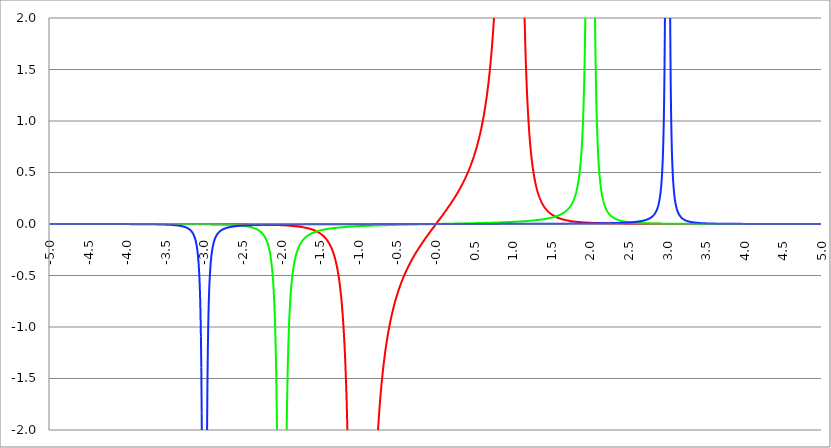
| Category | Series 1 | Series 0 | Series 2 |
|---|---|---|---|
| -5.0 | 0 | 0 | 0 |
| -4.995 | 0 | 0 | 0 |
| -4.99 | 0 | 0 | 0 |
| -4.985 | 0 | 0 | 0 |
| -4.98 | 0 | 0 | 0 |
| -4.975 | 0 | 0 | 0 |
| -4.97 | 0 | 0 | 0 |
| -4.965000000000001 | 0 | 0 | 0 |
| -4.960000000000001 | 0 | 0 | 0 |
| -4.955000000000001 | 0 | 0 | 0 |
| -4.950000000000001 | 0 | 0 | 0 |
| -4.945000000000001 | 0 | 0 | 0 |
| -4.940000000000001 | 0 | 0 | 0 |
| -4.935000000000001 | 0 | 0 | 0 |
| -4.930000000000001 | 0 | 0 | 0 |
| -4.925000000000002 | 0 | 0 | 0 |
| -4.920000000000002 | 0 | 0 | 0 |
| -4.915000000000002 | 0 | 0 | 0 |
| -4.910000000000002 | 0 | 0 | 0 |
| -4.905000000000002 | 0 | 0 | 0 |
| -4.900000000000002 | 0 | 0 | 0 |
| -4.895000000000002 | 0 | 0 | 0 |
| -4.890000000000002 | 0 | 0 | 0 |
| -4.885000000000002 | 0 | 0 | 0 |
| -4.880000000000002 | 0 | 0 | 0 |
| -4.875000000000003 | 0 | 0 | 0 |
| -4.870000000000003 | 0 | 0 | 0 |
| -4.865000000000003 | 0 | 0 | 0 |
| -4.860000000000003 | 0 | 0 | 0 |
| -4.855000000000003 | 0 | 0 | 0 |
| -4.850000000000003 | 0 | 0 | 0 |
| -4.845000000000003 | 0 | 0 | 0 |
| -4.840000000000003 | 0 | 0 | 0 |
| -4.835000000000003 | 0 | 0 | 0 |
| -4.830000000000004 | 0 | 0 | 0 |
| -4.825000000000004 | 0 | 0 | 0 |
| -4.820000000000004 | 0 | 0 | 0 |
| -4.815000000000004 | 0 | 0 | 0 |
| -4.810000000000004 | 0 | 0 | 0 |
| -4.805000000000004 | 0 | 0 | 0 |
| -4.800000000000004 | 0 | 0 | 0 |
| -4.795000000000004 | 0 | 0 | 0 |
| -4.790000000000004 | 0 | 0 | 0 |
| -4.785000000000004 | 0 | 0 | 0 |
| -4.780000000000004 | 0 | 0 | 0 |
| -4.775000000000004 | 0 | 0 | 0 |
| -4.770000000000004 | 0 | 0 | 0 |
| -4.765000000000005 | 0 | 0 | 0 |
| -4.760000000000005 | 0 | 0 | 0 |
| -4.755000000000005 | 0 | 0 | 0 |
| -4.750000000000005 | 0 | 0 | 0 |
| -4.745000000000005 | 0 | 0 | 0 |
| -4.740000000000005 | 0 | 0 | 0 |
| -4.735000000000005 | 0 | 0 | 0 |
| -4.730000000000005 | 0 | 0 | 0 |
| -4.725000000000006 | 0 | 0 | 0 |
| -4.720000000000006 | 0 | 0 | 0 |
| -4.715000000000006 | 0 | 0 | 0 |
| -4.710000000000006 | 0 | 0 | 0 |
| -4.705000000000006 | 0 | 0 | 0 |
| -4.700000000000006 | 0 | 0 | 0 |
| -4.695000000000006 | 0 | 0 | 0 |
| -4.690000000000006 | 0 | 0 | 0 |
| -4.685000000000007 | 0 | 0 | 0 |
| -4.680000000000007 | 0 | 0 | 0 |
| -4.675000000000007 | 0 | 0 | 0 |
| -4.670000000000007 | 0 | 0 | 0 |
| -4.665000000000007 | 0 | 0 | 0 |
| -4.660000000000007 | 0 | 0 | 0 |
| -4.655000000000007 | 0 | 0 | 0 |
| -4.650000000000007 | 0 | 0 | 0 |
| -4.645000000000007 | 0 | 0 | 0 |
| -4.640000000000008 | 0 | 0 | 0 |
| -4.635000000000008 | 0 | 0 | 0 |
| -4.630000000000008 | 0 | 0 | 0 |
| -4.625000000000008 | 0 | 0 | 0 |
| -4.620000000000008 | 0 | 0 | 0 |
| -4.615000000000008 | 0 | 0 | 0 |
| -4.610000000000008 | 0 | 0 | 0 |
| -4.605000000000008 | 0 | 0 | 0 |
| -4.600000000000008 | 0 | 0 | 0 |
| -4.595000000000009 | 0 | 0 | 0 |
| -4.590000000000009 | 0 | 0 | 0 |
| -4.585000000000009 | 0 | 0 | 0 |
| -4.580000000000009 | 0 | 0 | 0 |
| -4.57500000000001 | 0 | 0 | 0 |
| -4.57000000000001 | 0 | 0 | 0 |
| -4.565000000000009 | 0 | 0 | 0 |
| -4.560000000000009 | 0 | 0 | 0 |
| -4.555000000000009 | 0 | 0 | 0 |
| -4.55000000000001 | 0 | 0 | 0 |
| -4.54500000000001 | 0 | 0 | 0 |
| -4.54000000000001 | 0 | 0 | 0 |
| -4.53500000000001 | 0 | 0 | 0 |
| -4.53000000000001 | 0 | 0 | 0 |
| -4.52500000000001 | 0 | 0 | 0 |
| -4.52000000000001 | 0 | 0 | 0 |
| -4.51500000000001 | 0 | 0 | 0 |
| -4.51000000000001 | 0 | 0 | 0 |
| -4.505000000000011 | 0 | 0 | 0 |
| -4.500000000000011 | 0 | 0 | 0 |
| -4.495000000000011 | 0 | 0 | 0 |
| -4.490000000000011 | 0 | 0 | 0 |
| -4.485000000000011 | 0 | 0 | 0 |
| -4.480000000000011 | 0 | 0 | 0 |
| -4.475000000000011 | 0 | 0 | 0 |
| -4.470000000000011 | 0 | 0 | 0 |
| -4.465000000000011 | 0 | 0 | 0 |
| -4.460000000000011 | 0 | 0 | 0 |
| -4.455000000000012 | 0 | 0 | 0 |
| -4.450000000000012 | 0 | 0 | 0 |
| -4.445000000000012 | 0 | 0 | 0 |
| -4.440000000000012 | 0 | 0 | 0 |
| -4.435000000000012 | 0 | 0 | 0 |
| -4.430000000000012 | 0 | 0 | 0 |
| -4.425000000000012 | 0 | 0 | 0 |
| -4.420000000000012 | 0 | 0 | 0 |
| -4.415000000000012 | 0 | 0 | 0 |
| -4.410000000000013 | 0 | 0 | 0 |
| -4.405000000000013 | 0 | 0 | 0 |
| -4.400000000000013 | 0 | 0 | 0 |
| -4.395000000000013 | 0 | 0 | 0 |
| -4.390000000000013 | 0 | 0 | 0 |
| -4.385000000000013 | 0 | 0 | 0 |
| -4.380000000000013 | 0 | 0 | 0 |
| -4.375000000000013 | 0 | 0 | 0 |
| -4.370000000000013 | 0 | 0 | 0 |
| -4.365000000000013 | 0 | 0 | 0 |
| -4.360000000000014 | 0 | 0 | 0 |
| -4.355000000000014 | 0 | 0 | -0.001 |
| -4.350000000000014 | 0 | 0 | -0.001 |
| -4.345000000000014 | 0 | 0 | -0.001 |
| -4.340000000000014 | 0 | 0 | -0.001 |
| -4.335000000000014 | 0 | 0 | -0.001 |
| -4.330000000000014 | 0 | 0 | -0.001 |
| -4.325000000000014 | 0 | 0 | -0.001 |
| -4.320000000000014 | 0 | 0 | -0.001 |
| -4.315000000000015 | 0 | 0 | -0.001 |
| -4.310000000000015 | 0 | 0 | -0.001 |
| -4.305000000000015 | 0 | 0 | -0.001 |
| -4.300000000000015 | 0 | 0 | -0.001 |
| -4.295000000000015 | 0 | 0 | -0.001 |
| -4.290000000000015 | 0 | 0 | -0.001 |
| -4.285000000000015 | 0 | 0 | -0.001 |
| -4.280000000000015 | 0 | 0 | -0.001 |
| -4.275000000000015 | 0 | 0 | -0.001 |
| -4.270000000000015 | 0 | 0 | -0.001 |
| -4.265000000000016 | 0 | 0 | -0.001 |
| -4.260000000000016 | 0 | 0 | -0.001 |
| -4.255000000000016 | 0 | 0 | -0.001 |
| -4.250000000000016 | 0 | 0 | -0.001 |
| -4.245000000000016 | 0 | 0 | -0.001 |
| -4.240000000000016 | 0 | 0 | -0.001 |
| -4.235000000000016 | 0 | 0 | -0.001 |
| -4.230000000000016 | 0 | 0 | -0.001 |
| -4.225000000000017 | 0 | 0 | -0.001 |
| -4.220000000000017 | 0 | 0 | -0.001 |
| -4.215000000000017 | 0 | 0 | -0.001 |
| -4.210000000000017 | 0 | 0 | -0.001 |
| -4.205000000000017 | 0 | 0 | -0.001 |
| -4.200000000000017 | 0 | 0 | -0.001 |
| -4.195000000000017 | 0 | 0 | -0.001 |
| -4.190000000000017 | 0 | 0 | -0.001 |
| -4.185000000000017 | 0 | 0 | -0.001 |
| -4.180000000000017 | 0 | 0 | -0.001 |
| -4.175000000000018 | 0 | 0 | -0.001 |
| -4.170000000000018 | 0 | 0 | -0.001 |
| -4.165000000000018 | 0 | 0 | -0.001 |
| -4.160000000000018 | 0 | 0 | -0.001 |
| -4.155000000000018 | 0 | 0 | -0.001 |
| -4.150000000000018 | 0 | 0 | -0.001 |
| -4.145000000000018 | 0 | 0 | -0.001 |
| -4.140000000000018 | 0 | 0 | -0.001 |
| -4.135000000000018 | 0 | 0 | -0.001 |
| -4.130000000000019 | 0 | 0 | -0.001 |
| -4.125000000000019 | 0 | 0 | -0.001 |
| -4.120000000000019 | 0 | 0 | -0.001 |
| -4.115000000000019 | 0 | 0 | -0.001 |
| -4.110000000000019 | 0 | 0 | -0.001 |
| -4.105000000000019 | 0 | 0 | -0.001 |
| -4.100000000000019 | 0 | 0 | -0.001 |
| -4.095000000000019 | 0 | 0 | -0.001 |
| -4.090000000000019 | 0 | 0 | -0.001 |
| -4.085000000000019 | 0 | 0 | -0.001 |
| -4.08000000000002 | 0 | 0 | -0.001 |
| -4.07500000000002 | 0 | 0 | -0.001 |
| -4.07000000000002 | 0 | 0 | -0.001 |
| -4.06500000000002 | 0 | 0 | -0.001 |
| -4.06000000000002 | 0 | 0 | -0.001 |
| -4.05500000000002 | 0 | 0 | -0.001 |
| -4.05000000000002 | 0 | 0 | -0.001 |
| -4.04500000000002 | 0 | 0 | -0.001 |
| -4.04000000000002 | 0 | 0 | -0.001 |
| -4.03500000000002 | 0 | 0 | -0.001 |
| -4.03000000000002 | 0 | 0 | -0.001 |
| -4.025000000000021 | 0 | 0 | -0.001 |
| -4.020000000000021 | 0 | 0 | -0.001 |
| -4.015000000000021 | 0 | 0 | -0.001 |
| -4.010000000000021 | 0 | 0 | -0.001 |
| -4.005000000000021 | 0 | 0 | -0.001 |
| -4.000000000000021 | 0 | 0 | -0.001 |
| -3.995000000000021 | 0 | 0 | -0.001 |
| -3.990000000000021 | 0 | 0 | -0.001 |
| -3.985000000000022 | 0 | 0 | -0.001 |
| -3.980000000000022 | 0 | 0 | -0.001 |
| -3.975000000000022 | 0 | 0 | -0.001 |
| -3.970000000000022 | 0 | 0 | -0.001 |
| -3.965000000000022 | 0 | 0 | -0.001 |
| -3.960000000000022 | 0 | 0 | -0.001 |
| -3.955000000000022 | 0 | 0 | -0.001 |
| -3.950000000000022 | 0 | 0 | -0.001 |
| -3.945000000000022 | 0 | 0 | -0.001 |
| -3.940000000000023 | 0 | 0 | -0.001 |
| -3.935000000000023 | 0 | 0 | -0.001 |
| -3.930000000000023 | 0 | 0 | -0.001 |
| -3.925000000000023 | 0 | 0 | -0.001 |
| -3.920000000000023 | 0 | 0 | -0.001 |
| -3.915000000000023 | 0 | 0 | -0.001 |
| -3.910000000000023 | 0 | 0 | -0.001 |
| -3.905000000000023 | 0 | 0 | -0.001 |
| -3.900000000000023 | 0 | 0 | -0.001 |
| -3.895000000000023 | 0 | 0 | -0.001 |
| -3.890000000000024 | 0 | 0 | -0.002 |
| -3.885000000000024 | 0 | 0 | -0.002 |
| -3.880000000000024 | 0 | 0 | -0.002 |
| -3.875000000000024 | 0 | 0 | -0.002 |
| -3.870000000000024 | 0 | 0 | -0.002 |
| -3.865000000000024 | 0 | 0 | -0.002 |
| -3.860000000000024 | 0 | 0 | -0.002 |
| -3.855000000000024 | 0 | 0 | -0.002 |
| -3.850000000000024 | 0 | 0 | -0.002 |
| -3.845000000000025 | 0 | 0 | -0.002 |
| -3.840000000000025 | 0 | 0 | -0.002 |
| -3.835000000000025 | 0 | 0 | -0.002 |
| -3.830000000000025 | 0 | 0 | -0.002 |
| -3.825000000000025 | 0 | 0 | -0.002 |
| -3.820000000000025 | 0 | 0 | -0.002 |
| -3.815000000000025 | 0 | 0 | -0.002 |
| -3.810000000000025 | 0 | 0 | -0.002 |
| -3.805000000000025 | 0 | 0 | -0.002 |
| -3.800000000000026 | 0 | -0.001 | -0.002 |
| -3.795000000000026 | 0 | -0.001 | -0.002 |
| -3.790000000000026 | 0 | -0.001 | -0.002 |
| -3.785000000000026 | 0 | -0.001 | -0.002 |
| -3.780000000000026 | 0 | -0.001 | -0.002 |
| -3.775000000000026 | 0 | -0.001 | -0.002 |
| -3.770000000000026 | 0 | -0.001 | -0.002 |
| -3.765000000000026 | 0 | -0.001 | -0.002 |
| -3.760000000000026 | 0 | -0.001 | -0.002 |
| -3.755000000000026 | 0 | -0.001 | -0.002 |
| -3.750000000000027 | 0 | -0.001 | -0.002 |
| -3.745000000000027 | 0 | -0.001 | -0.002 |
| -3.740000000000027 | 0 | -0.001 | -0.002 |
| -3.735000000000027 | 0 | -0.001 | -0.002 |
| -3.730000000000027 | 0 | -0.001 | -0.002 |
| -3.725000000000027 | 0 | -0.001 | -0.003 |
| -3.720000000000027 | 0 | -0.001 | -0.003 |
| -3.715000000000027 | 0 | -0.001 | -0.003 |
| -3.710000000000027 | 0 | -0.001 | -0.003 |
| -3.705000000000028 | 0 | -0.001 | -0.003 |
| -3.700000000000028 | 0 | -0.001 | -0.003 |
| -3.695000000000028 | 0 | -0.001 | -0.003 |
| -3.690000000000028 | 0 | -0.001 | -0.003 |
| -3.685000000000028 | 0 | -0.001 | -0.003 |
| -3.680000000000028 | 0 | -0.001 | -0.003 |
| -3.675000000000028 | 0 | -0.001 | -0.003 |
| -3.670000000000028 | 0 | -0.001 | -0.003 |
| -3.665000000000028 | 0 | -0.001 | -0.003 |
| -3.660000000000028 | 0 | -0.001 | -0.003 |
| -3.655000000000029 | 0 | -0.001 | -0.003 |
| -3.650000000000029 | 0 | -0.001 | -0.003 |
| -3.645000000000029 | 0 | -0.001 | -0.003 |
| -3.640000000000029 | 0 | -0.001 | -0.003 |
| -3.635000000000029 | 0 | -0.001 | -0.004 |
| -3.630000000000029 | 0 | -0.001 | -0.004 |
| -3.625000000000029 | 0 | -0.001 | -0.004 |
| -3.620000000000029 | 0 | -0.001 | -0.004 |
| -3.615000000000029 | 0 | -0.001 | -0.004 |
| -3.61000000000003 | 0 | -0.001 | -0.004 |
| -3.60500000000003 | 0 | -0.001 | -0.004 |
| -3.60000000000003 | 0 | -0.001 | -0.004 |
| -3.59500000000003 | 0 | -0.001 | -0.004 |
| -3.59000000000003 | 0 | -0.001 | -0.004 |
| -3.58500000000003 | 0 | -0.001 | -0.004 |
| -3.58000000000003 | 0 | -0.001 | -0.004 |
| -3.57500000000003 | 0 | -0.001 | -0.004 |
| -3.57000000000003 | 0 | -0.001 | -0.005 |
| -3.565000000000031 | 0 | -0.001 | -0.005 |
| -3.560000000000031 | 0 | -0.001 | -0.005 |
| -3.555000000000031 | 0 | -0.001 | -0.005 |
| -3.550000000000031 | 0 | -0.001 | -0.005 |
| -3.545000000000031 | 0 | -0.001 | -0.005 |
| -3.540000000000031 | 0 | -0.001 | -0.005 |
| -3.535000000000031 | 0 | -0.001 | -0.005 |
| -3.530000000000031 | 0 | -0.001 | -0.005 |
| -3.525000000000031 | 0 | -0.001 | -0.006 |
| -3.520000000000032 | 0 | -0.001 | -0.006 |
| -3.515000000000032 | 0 | -0.001 | -0.006 |
| -3.510000000000032 | 0 | -0.001 | -0.006 |
| -3.505000000000032 | 0 | -0.001 | -0.006 |
| -3.500000000000032 | 0 | -0.001 | -0.006 |
| -3.495000000000032 | 0 | -0.001 | -0.006 |
| -3.490000000000032 | 0 | -0.001 | -0.006 |
| -3.485000000000032 | 0 | -0.001 | -0.007 |
| -3.480000000000032 | 0 | -0.001 | -0.007 |
| -3.475000000000032 | 0 | -0.001 | -0.007 |
| -3.470000000000033 | 0 | -0.001 | -0.007 |
| -3.465000000000033 | 0 | -0.001 | -0.007 |
| -3.460000000000033 | 0 | -0.001 | -0.008 |
| -3.455000000000033 | 0 | -0.001 | -0.008 |
| -3.450000000000033 | 0 | -0.001 | -0.008 |
| -3.445000000000033 | 0 | -0.001 | -0.008 |
| -3.440000000000033 | -0.001 | -0.001 | -0.008 |
| -3.435000000000033 | -0.001 | -0.001 | -0.009 |
| -3.430000000000033 | -0.001 | -0.001 | -0.009 |
| -3.425000000000034 | -0.001 | -0.001 | -0.009 |
| -3.420000000000034 | -0.001 | -0.001 | -0.009 |
| -3.415000000000034 | -0.001 | -0.001 | -0.01 |
| -3.410000000000034 | -0.001 | -0.001 | -0.01 |
| -3.405000000000034 | -0.001 | -0.001 | -0.01 |
| -3.400000000000034 | -0.001 | -0.001 | -0.01 |
| -3.395000000000034 | -0.001 | -0.001 | -0.011 |
| -3.390000000000034 | -0.001 | -0.001 | -0.011 |
| -3.385000000000034 | -0.001 | -0.001 | -0.011 |
| -3.380000000000034 | -0.001 | -0.001 | -0.012 |
| -3.375000000000035 | -0.001 | -0.001 | -0.012 |
| -3.370000000000035 | -0.001 | -0.001 | -0.012 |
| -3.365000000000035 | -0.001 | -0.001 | -0.013 |
| -3.360000000000035 | -0.001 | -0.001 | -0.013 |
| -3.355000000000035 | -0.001 | -0.001 | -0.014 |
| -3.350000000000035 | -0.001 | -0.001 | -0.014 |
| -3.345000000000035 | -0.001 | -0.001 | -0.015 |
| -3.340000000000035 | -0.001 | -0.001 | -0.015 |
| -3.335000000000035 | -0.001 | -0.001 | -0.016 |
| -3.330000000000036 | -0.001 | -0.001 | -0.016 |
| -3.325000000000036 | -0.001 | -0.001 | -0.017 |
| -3.320000000000036 | -0.001 | -0.001 | -0.017 |
| -3.315000000000036 | -0.001 | -0.001 | -0.018 |
| -3.310000000000036 | -0.001 | -0.001 | -0.019 |
| -3.305000000000036 | -0.001 | -0.001 | -0.019 |
| -3.300000000000036 | -0.001 | -0.001 | -0.02 |
| -3.295000000000036 | -0.001 | -0.001 | -0.021 |
| -3.290000000000036 | -0.001 | -0.001 | -0.021 |
| -3.285000000000036 | -0.001 | -0.001 | -0.022 |
| -3.280000000000036 | -0.001 | -0.001 | -0.023 |
| -3.275000000000037 | -0.001 | -0.001 | -0.024 |
| -3.270000000000037 | -0.001 | -0.001 | -0.025 |
| -3.265000000000037 | -0.001 | -0.001 | -0.026 |
| -3.260000000000037 | -0.001 | -0.001 | -0.027 |
| -3.255000000000037 | -0.001 | -0.002 | -0.029 |
| -3.250000000000037 | -0.001 | -0.002 | -0.03 |
| -3.245000000000037 | -0.001 | -0.002 | -0.031 |
| -3.240000000000037 | -0.001 | -0.002 | -0.033 |
| -3.235000000000038 | -0.001 | -0.002 | -0.034 |
| -3.230000000000038 | -0.001 | -0.002 | -0.036 |
| -3.225000000000038 | -0.001 | -0.002 | -0.038 |
| -3.220000000000038 | -0.001 | -0.002 | -0.039 |
| -3.215000000000038 | -0.001 | -0.002 | -0.041 |
| -3.210000000000038 | -0.001 | -0.002 | -0.044 |
| -3.205000000000038 | -0.001 | -0.002 | -0.046 |
| -3.200000000000038 | -0.001 | -0.002 | -0.049 |
| -3.195000000000038 | -0.001 | -0.002 | -0.051 |
| -3.190000000000039 | -0.001 | -0.002 | -0.054 |
| -3.185000000000039 | -0.001 | -0.002 | -0.057 |
| -3.180000000000039 | -0.001 | -0.002 | -0.061 |
| -3.175000000000039 | -0.001 | -0.002 | -0.065 |
| -3.170000000000039 | -0.001 | -0.002 | -0.069 |
| -3.16500000000004 | -0.001 | -0.002 | -0.073 |
| -3.16000000000004 | -0.001 | -0.002 | -0.078 |
| -3.155000000000039 | -0.001 | -0.002 | -0.084 |
| -3.150000000000039 | -0.001 | -0.002 | -0.09 |
| -3.14500000000004 | -0.001 | -0.002 | -0.097 |
| -3.14000000000004 | -0.001 | -0.002 | -0.104 |
| -3.13500000000004 | -0.001 | -0.002 | -0.112 |
| -3.13000000000004 | -0.001 | -0.002 | -0.122 |
| -3.12500000000004 | -0.001 | -0.002 | -0.132 |
| -3.12000000000004 | -0.001 | -0.002 | -0.144 |
| -3.11500000000004 | -0.001 | -0.002 | -0.158 |
| -3.11000000000004 | -0.001 | -0.002 | -0.173 |
| -3.10500000000004 | -0.001 | -0.002 | -0.191 |
| -3.10000000000004 | -0.001 | -0.002 | -0.211 |
| -3.095000000000041 | -0.001 | -0.002 | -0.235 |
| -3.090000000000041 | -0.001 | -0.002 | -0.263 |
| -3.085000000000041 | -0.001 | -0.002 | -0.296 |
| -3.080000000000041 | -0.001 | -0.002 | -0.336 |
| -3.075000000000041 | -0.001 | -0.002 | -0.384 |
| -3.070000000000041 | -0.001 | -0.002 | -0.442 |
| -3.065000000000041 | -0.001 | -0.002 | -0.515 |
| -3.060000000000041 | -0.001 | -0.002 | -0.608 |
| -3.055000000000041 | -0.001 | -0.002 | -0.726 |
| -3.050000000000042 | -0.001 | -0.003 | -0.883 |
| -3.045000000000042 | -0.001 | -0.003 | -1.095 |
| -3.040000000000042 | -0.001 | -0.003 | -1.392 |
| -3.035000000000042 | -0.001 | -0.003 | -1.827 |
| -3.030000000000042 | -0.001 | -0.003 | -2.499 |
| -3.025000000000042 | -0.001 | -0.003 | -3.615 |
| -3.020000000000042 | -0.001 | -0.003 | -5.675 |
| -3.015000000000042 | -0.001 | -0.003 | -10.138 |
| -3.010000000000042 | -0.001 | -0.003 | -22.921 |
| -3.005000000000043 | -0.001 | -0.003 | -92.135 |
| -3.000000000000043 | -0.001 | -0.003 | -1273600863462290060476416 |
| -2.995000000000043 | -0.001 | -0.003 | -93.061 |
| -2.990000000000043 | -0.001 | -0.003 | -23.384 |
| -2.985000000000043 | -0.001 | -0.003 | -10.447 |
| -2.980000000000043 | -0.001 | -0.003 | -5.907 |
| -2.975000000000043 | -0.001 | -0.003 | -3.8 |
| -2.970000000000043 | -0.001 | -0.003 | -2.653 |
| -2.965000000000043 | -0.001 | -0.003 | -1.959 |
| -2.960000000000043 | -0.001 | -0.003 | -1.508 |
| -2.955000000000044 | -0.001 | -0.003 | -1.198 |
| -2.950000000000044 | -0.001 | -0.003 | -0.975 |
| -2.945000000000044 | -0.001 | -0.003 | -0.81 |
| -2.940000000000044 | -0.001 | -0.003 | -0.685 |
| -2.935000000000044 | -0.001 | -0.003 | -0.587 |
| -2.930000000000044 | -0.001 | -0.004 | -0.508 |
| -2.925000000000044 | -0.001 | -0.004 | -0.445 |
| -2.920000000000044 | -0.001 | -0.004 | -0.393 |
| -2.915000000000044 | -0.001 | -0.004 | -0.35 |
| -2.910000000000045 | -0.001 | -0.004 | -0.314 |
| -2.905000000000045 | -0.001 | -0.004 | -0.284 |
| -2.900000000000045 | -0.001 | -0.004 | -0.257 |
| -2.895000000000045 | -0.001 | -0.004 | -0.235 |
| -2.890000000000045 | -0.001 | -0.004 | -0.215 |
| -2.885000000000045 | -0.001 | -0.004 | -0.198 |
| -2.880000000000045 | -0.001 | -0.004 | -0.183 |
| -2.875000000000045 | -0.001 | -0.004 | -0.169 |
| -2.870000000000045 | -0.001 | -0.004 | -0.157 |
| -2.865000000000045 | -0.001 | -0.004 | -0.147 |
| -2.860000000000046 | -0.001 | -0.004 | -0.137 |
| -2.855000000000046 | -0.001 | -0.004 | -0.128 |
| -2.850000000000046 | -0.001 | -0.004 | -0.121 |
| -2.845000000000046 | -0.001 | -0.005 | -0.114 |
| -2.840000000000046 | -0.001 | -0.005 | -0.107 |
| -2.835000000000046 | -0.001 | -0.005 | -0.101 |
| -2.830000000000046 | -0.001 | -0.005 | -0.096 |
| -2.825000000000046 | -0.001 | -0.005 | -0.091 |
| -2.820000000000046 | -0.001 | -0.005 | -0.087 |
| -2.815000000000047 | -0.002 | -0.005 | -0.082 |
| -2.810000000000047 | -0.002 | -0.005 | -0.078 |
| -2.805000000000047 | -0.002 | -0.005 | -0.075 |
| -2.800000000000047 | -0.002 | -0.005 | -0.072 |
| -2.795000000000047 | -0.002 | -0.005 | -0.068 |
| -2.790000000000047 | -0.002 | -0.005 | -0.066 |
| -2.785000000000047 | -0.002 | -0.006 | -0.063 |
| -2.780000000000047 | -0.002 | -0.006 | -0.06 |
| -2.775000000000047 | -0.002 | -0.006 | -0.058 |
| -2.770000000000047 | -0.002 | -0.006 | -0.056 |
| -2.765000000000048 | -0.002 | -0.006 | -0.054 |
| -2.760000000000048 | -0.002 | -0.006 | -0.052 |
| -2.755000000000048 | -0.002 | -0.006 | -0.05 |
| -2.750000000000048 | -0.002 | -0.006 | -0.048 |
| -2.745000000000048 | -0.002 | -0.006 | -0.047 |
| -2.740000000000048 | -0.002 | -0.006 | -0.045 |
| -2.735000000000048 | -0.002 | -0.007 | -0.044 |
| -2.730000000000048 | -0.002 | -0.007 | -0.042 |
| -2.725000000000048 | -0.002 | -0.007 | -0.041 |
| -2.720000000000049 | -0.002 | -0.007 | -0.04 |
| -2.715000000000049 | -0.002 | -0.007 | -0.038 |
| -2.710000000000049 | -0.002 | -0.007 | -0.037 |
| -2.705000000000049 | -0.002 | -0.007 | -0.036 |
| -2.700000000000049 | -0.002 | -0.008 | -0.035 |
| -2.695000000000049 | -0.002 | -0.008 | -0.034 |
| -2.690000000000049 | -0.002 | -0.008 | -0.033 |
| -2.685000000000049 | -0.002 | -0.008 | -0.032 |
| -2.680000000000049 | -0.002 | -0.008 | -0.032 |
| -2.675000000000049 | -0.002 | -0.008 | -0.031 |
| -2.67000000000005 | -0.002 | -0.008 | -0.03 |
| -2.66500000000005 | -0.002 | -0.009 | -0.029 |
| -2.66000000000005 | -0.002 | -0.009 | -0.029 |
| -2.65500000000005 | -0.002 | -0.009 | -0.028 |
| -2.65000000000005 | -0.002 | -0.009 | -0.027 |
| -2.64500000000005 | -0.002 | -0.009 | -0.027 |
| -2.64000000000005 | -0.002 | -0.009 | -0.026 |
| -2.63500000000005 | -0.002 | -0.01 | -0.025 |
| -2.63000000000005 | -0.002 | -0.01 | -0.025 |
| -2.625000000000051 | -0.002 | -0.01 | -0.024 |
| -2.620000000000051 | -0.002 | -0.01 | -0.024 |
| -2.615000000000051 | -0.002 | -0.011 | -0.023 |
| -2.610000000000051 | -0.002 | -0.011 | -0.023 |
| -2.605000000000051 | -0.002 | -0.011 | -0.022 |
| -2.600000000000051 | -0.002 | -0.011 | -0.022 |
| -2.595000000000051 | -0.002 | -0.011 | -0.021 |
| -2.590000000000051 | -0.002 | -0.012 | -0.021 |
| -2.585000000000051 | -0.002 | -0.012 | -0.021 |
| -2.580000000000052 | -0.002 | -0.012 | -0.02 |
| -2.575000000000052 | -0.003 | -0.012 | -0.02 |
| -2.570000000000052 | -0.003 | -0.013 | -0.019 |
| -2.565000000000052 | -0.003 | -0.013 | -0.019 |
| -2.560000000000052 | -0.003 | -0.013 | -0.019 |
| -2.555000000000052 | -0.003 | -0.014 | -0.018 |
| -2.550000000000052 | -0.003 | -0.014 | -0.018 |
| -2.545000000000052 | -0.003 | -0.014 | -0.018 |
| -2.540000000000052 | -0.003 | -0.015 | -0.017 |
| -2.535000000000053 | -0.003 | -0.015 | -0.017 |
| -2.530000000000053 | -0.003 | -0.015 | -0.017 |
| -2.525000000000053 | -0.003 | -0.016 | -0.017 |
| -2.520000000000053 | -0.003 | -0.016 | -0.016 |
| -2.515000000000053 | -0.003 | -0.016 | -0.016 |
| -2.510000000000053 | -0.003 | -0.017 | -0.016 |
| -2.505000000000053 | -0.003 | -0.017 | -0.015 |
| -2.500000000000053 | -0.003 | -0.018 | -0.015 |
| -2.495000000000053 | -0.003 | -0.018 | -0.015 |
| -2.490000000000053 | -0.003 | -0.019 | -0.015 |
| -2.485000000000054 | -0.003 | -0.019 | -0.015 |
| -2.480000000000054 | -0.003 | -0.02 | -0.014 |
| -2.475000000000054 | -0.003 | -0.02 | -0.014 |
| -2.470000000000054 | -0.003 | -0.021 | -0.014 |
| -2.465000000000054 | -0.003 | -0.021 | -0.014 |
| -2.460000000000054 | -0.003 | -0.022 | -0.014 |
| -2.455000000000054 | -0.003 | -0.022 | -0.013 |
| -2.450000000000054 | -0.003 | -0.023 | -0.013 |
| -2.445000000000054 | -0.003 | -0.024 | -0.013 |
| -2.440000000000055 | -0.003 | -0.024 | -0.013 |
| -2.435000000000055 | -0.003 | -0.025 | -0.013 |
| -2.430000000000055 | -0.004 | -0.026 | -0.012 |
| -2.425000000000055 | -0.004 | -0.026 | -0.012 |
| -2.420000000000055 | -0.004 | -0.027 | -0.012 |
| -2.415000000000055 | -0.004 | -0.028 | -0.012 |
| -2.410000000000055 | -0.004 | -0.029 | -0.012 |
| -2.405000000000055 | -0.004 | -0.03 | -0.012 |
| -2.400000000000055 | -0.004 | -0.031 | -0.011 |
| -2.395000000000055 | -0.004 | -0.031 | -0.011 |
| -2.390000000000056 | -0.004 | -0.032 | -0.011 |
| -2.385000000000056 | -0.004 | -0.033 | -0.011 |
| -2.380000000000056 | -0.004 | -0.035 | -0.011 |
| -2.375000000000056 | -0.004 | -0.036 | -0.011 |
| -2.370000000000056 | -0.004 | -0.037 | -0.011 |
| -2.365000000000056 | -0.004 | -0.038 | -0.011 |
| -2.360000000000056 | -0.004 | -0.039 | -0.01 |
| -2.355000000000056 | -0.004 | -0.041 | -0.01 |
| -2.350000000000056 | -0.004 | -0.042 | -0.01 |
| -2.345000000000057 | -0.004 | -0.043 | -0.01 |
| -2.340000000000057 | -0.004 | -0.045 | -0.01 |
| -2.335000000000057 | -0.004 | -0.047 | -0.01 |
| -2.330000000000057 | -0.004 | -0.048 | -0.01 |
| -2.325000000000057 | -0.005 | -0.05 | -0.01 |
| -2.320000000000057 | -0.005 | -0.052 | -0.009 |
| -2.315000000000057 | -0.005 | -0.054 | -0.009 |
| -2.310000000000057 | -0.005 | -0.056 | -0.009 |
| -2.305000000000057 | -0.005 | -0.058 | -0.009 |
| -2.300000000000058 | -0.005 | -0.06 | -0.009 |
| -2.295000000000058 | -0.005 | -0.063 | -0.009 |
| -2.290000000000058 | -0.005 | -0.065 | -0.009 |
| -2.285000000000058 | -0.005 | -0.068 | -0.009 |
| -2.280000000000058 | -0.005 | -0.071 | -0.009 |
| -2.275000000000058 | -0.005 | -0.074 | -0.009 |
| -2.270000000000058 | -0.005 | -0.077 | -0.009 |
| -2.265000000000058 | -0.005 | -0.08 | -0.008 |
| -2.260000000000058 | -0.005 | -0.084 | -0.008 |
| -2.255000000000058 | -0.005 | -0.087 | -0.008 |
| -2.250000000000059 | -0.006 | -0.092 | -0.008 |
| -2.245000000000059 | -0.006 | -0.096 | -0.008 |
| -2.240000000000059 | -0.006 | -0.1 | -0.008 |
| -2.235000000000059 | -0.006 | -0.105 | -0.008 |
| -2.23000000000006 | -0.006 | -0.111 | -0.008 |
| -2.22500000000006 | -0.006 | -0.116 | -0.008 |
| -2.22000000000006 | -0.006 | -0.122 | -0.008 |
| -2.215000000000059 | -0.006 | -0.129 | -0.008 |
| -2.210000000000059 | -0.006 | -0.136 | -0.008 |
| -2.20500000000006 | -0.006 | -0.143 | -0.007 |
| -2.20000000000006 | -0.006 | -0.151 | -0.007 |
| -2.19500000000006 | -0.006 | -0.16 | -0.007 |
| -2.19000000000006 | -0.007 | -0.17 | -0.007 |
| -2.18500000000006 | -0.007 | -0.18 | -0.007 |
| -2.18000000000006 | -0.007 | -0.191 | -0.007 |
| -2.17500000000006 | -0.007 | -0.203 | -0.007 |
| -2.17000000000006 | -0.007 | -0.217 | -0.007 |
| -2.16500000000006 | -0.007 | -0.232 | -0.007 |
| -2.160000000000061 | -0.007 | -0.248 | -0.007 |
| -2.155000000000061 | -0.007 | -0.266 | -0.007 |
| -2.150000000000061 | -0.007 | -0.285 | -0.007 |
| -2.145000000000061 | -0.007 | -0.307 | -0.007 |
| -2.140000000000061 | -0.008 | -0.331 | -0.007 |
| -2.135000000000061 | -0.008 | -0.359 | -0.007 |
| -2.130000000000061 | -0.008 | -0.389 | -0.007 |
| -2.125000000000061 | -0.008 | -0.423 | -0.006 |
| -2.120000000000061 | -0.008 | -0.462 | -0.006 |
| -2.115000000000061 | -0.008 | -0.506 | -0.006 |
| -2.110000000000062 | -0.008 | -0.557 | -0.006 |
| -2.105000000000062 | -0.008 | -0.615 | -0.006 |
| -2.100000000000062 | -0.008 | -0.682 | -0.006 |
| -2.095000000000062 | -0.009 | -0.761 | -0.006 |
| -2.090000000000062 | -0.009 | -0.853 | -0.006 |
| -2.085000000000062 | -0.009 | -0.963 | -0.006 |
| -2.080000000000062 | -0.009 | -1.094 | -0.006 |
| -2.075000000000062 | -0.009 | -1.253 | -0.006 |
| -2.070000000000062 | -0.009 | -1.447 | -0.006 |
| -2.065000000000063 | -0.009 | -1.69 | -0.006 |
| -2.060000000000063 | -0.01 | -1.996 | -0.006 |
| -2.055000000000063 | -0.01 | -2.391 | -0.006 |
| -2.050000000000063 | -0.01 | -2.913 | -0.006 |
| -2.045000000000063 | -0.01 | -3.621 | -0.006 |
| -2.040000000000063 | -0.01 | -4.614 | -0.006 |
| -2.035000000000063 | -0.01 | -6.067 | -0.006 |
| -2.030000000000063 | -0.01 | -8.315 | -0.006 |
| -2.025000000000063 | -0.011 | -12.058 | -0.006 |
| -2.020000000000064 | -0.011 | -18.973 | -0.005 |
| -2.015000000000064 | -0.011 | -33.97 | -0.005 |
| -2.010000000000064 | -0.011 | -76.985 | -0.005 |
| -2.005000000000064 | -0.011 | -310.192 | -0.005 |
| -2.000000000000064 | -0.012 | -1910401295193370129334272 | -0.005 |
| -1.995000000000064 | -0.012 | -314.879 | -0.005 |
| -1.990000000000064 | -0.012 | -79.329 | -0.005 |
| -1.985000000000064 | -0.012 | -35.533 | -0.005 |
| -1.980000000000064 | -0.012 | -20.145 | -0.005 |
| -1.975000000000064 | -0.013 | -12.995 | -0.005 |
| -1.970000000000065 | -0.013 | -9.096 | -0.005 |
| -1.965000000000065 | -0.013 | -6.737 | -0.005 |
| -1.960000000000065 | -0.013 | -5.199 | -0.005 |
| -1.955000000000065 | -0.013 | -4.141 | -0.005 |
| -1.950000000000065 | -0.014 | -3.382 | -0.005 |
| -1.945000000000065 | -0.014 | -2.817 | -0.005 |
| -1.940000000000065 | -0.014 | -2.386 | -0.005 |
| -1.935000000000065 | -0.014 | -2.05 | -0.005 |
| -1.930000000000065 | -0.015 | -1.782 | -0.005 |
| -1.925000000000066 | -0.015 | -1.565 | -0.005 |
| -1.920000000000066 | -0.015 | -1.386 | -0.005 |
| -1.915000000000066 | -0.015 | -1.238 | -0.005 |
| -1.910000000000066 | -0.016 | -1.113 | -0.005 |
| -1.905000000000066 | -0.016 | -1.007 | -0.005 |
| -1.900000000000066 | -0.016 | -0.916 | -0.005 |
| -1.895000000000066 | -0.016 | -0.838 | -0.005 |
| -1.890000000000066 | -0.017 | -0.77 | -0.005 |
| -1.885000000000066 | -0.017 | -0.71 | -0.005 |
| -1.880000000000066 | -0.017 | -0.657 | -0.004 |
| -1.875000000000067 | -0.018 | -0.61 | -0.004 |
| -1.870000000000067 | -0.018 | -0.569 | -0.004 |
| -1.865000000000067 | -0.018 | -0.532 | -0.004 |
| -1.860000000000067 | -0.019 | -0.498 | -0.004 |
| -1.855000000000067 | -0.019 | -0.468 | -0.004 |
| -1.850000000000067 | -0.019 | -0.441 | -0.004 |
| -1.845000000000067 | -0.02 | -0.416 | -0.004 |
| -1.840000000000067 | -0.02 | -0.393 | -0.004 |
| -1.835000000000067 | -0.02 | -0.373 | -0.004 |
| -1.830000000000068 | -0.021 | -0.354 | -0.004 |
| -1.825000000000068 | -0.021 | -0.337 | -0.004 |
| -1.820000000000068 | -0.022 | -0.321 | -0.004 |
| -1.815000000000068 | -0.022 | -0.306 | -0.004 |
| -1.810000000000068 | -0.022 | -0.292 | -0.004 |
| -1.805000000000068 | -0.023 | -0.279 | -0.004 |
| -1.800000000000068 | -0.023 | -0.268 | -0.004 |
| -1.795000000000068 | -0.024 | -0.257 | -0.004 |
| -1.790000000000068 | -0.024 | -0.246 | -0.004 |
| -1.785000000000068 | -0.025 | -0.237 | -0.004 |
| -1.780000000000069 | -0.025 | -0.228 | -0.004 |
| -1.775000000000069 | -0.026 | -0.219 | -0.004 |
| -1.770000000000069 | -0.026 | -0.211 | -0.004 |
| -1.765000000000069 | -0.027 | -0.204 | -0.004 |
| -1.760000000000069 | -0.027 | -0.197 | -0.004 |
| -1.75500000000007 | -0.028 | -0.19 | -0.004 |
| -1.75000000000007 | -0.028 | -0.184 | -0.004 |
| -1.745000000000069 | -0.029 | -0.178 | -0.004 |
| -1.740000000000069 | -0.029 | -0.173 | -0.004 |
| -1.73500000000007 | -0.03 | -0.167 | -0.004 |
| -1.73000000000007 | -0.031 | -0.162 | -0.004 |
| -1.72500000000007 | -0.031 | -0.157 | -0.004 |
| -1.72000000000007 | -0.032 | -0.153 | -0.004 |
| -1.71500000000007 | -0.033 | -0.149 | -0.004 |
| -1.71000000000007 | -0.033 | -0.145 | -0.004 |
| -1.70500000000007 | -0.034 | -0.141 | -0.004 |
| -1.70000000000007 | -0.035 | -0.137 | -0.004 |
| -1.69500000000007 | -0.036 | -0.133 | -0.004 |
| -1.69000000000007 | -0.036 | -0.13 | -0.004 |
| -1.685000000000071 | -0.037 | -0.127 | -0.003 |
| -1.680000000000071 | -0.038 | -0.123 | -0.003 |
| -1.675000000000071 | -0.039 | -0.12 | -0.003 |
| -1.670000000000071 | -0.04 | -0.118 | -0.003 |
| -1.665000000000071 | -0.041 | -0.115 | -0.003 |
| -1.660000000000071 | -0.041 | -0.112 | -0.003 |
| -1.655000000000071 | -0.042 | -0.11 | -0.003 |
| -1.650000000000071 | -0.043 | -0.107 | -0.003 |
| -1.645000000000071 | -0.044 | -0.105 | -0.003 |
| -1.640000000000072 | -0.045 | -0.103 | -0.003 |
| -1.635000000000072 | -0.046 | -0.1 | -0.003 |
| -1.630000000000072 | -0.047 | -0.098 | -0.003 |
| -1.625000000000072 | -0.049 | -0.096 | -0.003 |
| -1.620000000000072 | -0.05 | -0.094 | -0.003 |
| -1.615000000000072 | -0.051 | -0.092 | -0.003 |
| -1.610000000000072 | -0.052 | -0.091 | -0.003 |
| -1.605000000000072 | -0.053 | -0.089 | -0.003 |
| -1.600000000000072 | -0.055 | -0.087 | -0.003 |
| -1.595000000000073 | -0.056 | -0.085 | -0.003 |
| -1.590000000000073 | -0.057 | -0.084 | -0.003 |
| -1.585000000000073 | -0.059 | -0.082 | -0.003 |
| -1.580000000000073 | -0.06 | -0.081 | -0.003 |
| -1.575000000000073 | -0.062 | -0.079 | -0.003 |
| -1.570000000000073 | -0.063 | -0.078 | -0.003 |
| -1.565000000000073 | -0.065 | -0.077 | -0.003 |
| -1.560000000000073 | -0.067 | -0.075 | -0.003 |
| -1.555000000000073 | -0.068 | -0.074 | -0.003 |
| -1.550000000000074 | -0.07 | -0.073 | -0.003 |
| -1.545000000000074 | -0.072 | -0.072 | -0.003 |
| -1.540000000000074 | -0.074 | -0.07 | -0.003 |
| -1.535000000000074 | -0.076 | -0.069 | -0.003 |
| -1.530000000000074 | -0.078 | -0.068 | -0.003 |
| -1.525000000000074 | -0.08 | -0.067 | -0.003 |
| -1.520000000000074 | -0.082 | -0.066 | -0.003 |
| -1.515000000000074 | -0.084 | -0.065 | -0.003 |
| -1.510000000000074 | -0.087 | -0.064 | -0.003 |
| -1.505000000000074 | -0.089 | -0.063 | -0.003 |
| -1.500000000000075 | -0.092 | -0.062 | -0.003 |
| -1.495000000000075 | -0.094 | -0.061 | -0.003 |
| -1.490000000000075 | -0.097 | -0.06 | -0.003 |
| -1.485000000000075 | -0.1 | -0.059 | -0.003 |
| -1.480000000000075 | -0.103 | -0.059 | -0.003 |
| -1.475000000000075 | -0.106 | -0.058 | -0.003 |
| -1.470000000000075 | -0.109 | -0.057 | -0.003 |
| -1.465000000000075 | -0.112 | -0.056 | -0.003 |
| -1.460000000000075 | -0.116 | -0.055 | -0.003 |
| -1.455000000000076 | -0.119 | -0.055 | -0.003 |
| -1.450000000000076 | -0.123 | -0.054 | -0.003 |
| -1.445000000000076 | -0.127 | -0.053 | -0.003 |
| -1.440000000000076 | -0.131 | -0.052 | -0.003 |
| -1.435000000000076 | -0.135 | -0.052 | -0.003 |
| -1.430000000000076 | -0.139 | -0.051 | -0.003 |
| -1.425000000000076 | -0.143 | -0.05 | -0.003 |
| -1.420000000000076 | -0.148 | -0.05 | -0.003 |
| -1.415000000000076 | -0.153 | -0.049 | -0.003 |
| -1.410000000000077 | -0.158 | -0.048 | -0.003 |
| -1.405000000000077 | -0.163 | -0.048 | -0.003 |
| -1.400000000000077 | -0.169 | -0.047 | -0.002 |
| -1.395000000000077 | -0.175 | -0.047 | -0.002 |
| -1.390000000000077 | -0.181 | -0.046 | -0.002 |
| -1.385000000000077 | -0.187 | -0.046 | -0.002 |
| -1.380000000000077 | -0.194 | -0.045 | -0.002 |
| -1.375000000000077 | -0.201 | -0.044 | -0.002 |
| -1.370000000000077 | -0.208 | -0.044 | -0.002 |
| -1.365000000000077 | -0.215 | -0.043 | -0.002 |
| -1.360000000000078 | -0.223 | -0.043 | -0.002 |
| -1.355000000000078 | -0.232 | -0.042 | -0.002 |
| -1.350000000000078 | -0.24 | -0.042 | -0.002 |
| -1.345000000000078 | -0.25 | -0.041 | -0.002 |
| -1.340000000000078 | -0.259 | -0.041 | -0.002 |
| -1.335000000000078 | -0.27 | -0.041 | -0.002 |
| -1.330000000000078 | -0.28 | -0.04 | -0.002 |
| -1.325000000000078 | -0.292 | -0.04 | -0.002 |
| -1.320000000000078 | -0.303 | -0.039 | -0.002 |
| -1.315000000000079 | -0.316 | -0.039 | -0.002 |
| -1.310000000000079 | -0.329 | -0.038 | -0.002 |
| -1.305000000000079 | -0.343 | -0.038 | -0.002 |
| -1.300000000000079 | -0.358 | -0.038 | -0.002 |
| -1.295000000000079 | -0.374 | -0.037 | -0.002 |
| -1.29000000000008 | -0.39 | -0.037 | -0.002 |
| -1.285000000000079 | -0.408 | -0.036 | -0.002 |
| -1.280000000000079 | -0.427 | -0.036 | -0.002 |
| -1.275000000000079 | -0.446 | -0.036 | -0.002 |
| -1.270000000000079 | -0.467 | -0.035 | -0.002 |
| -1.26500000000008 | -0.49 | -0.035 | -0.002 |
| -1.26000000000008 | -0.514 | -0.034 | -0.002 |
| -1.25500000000008 | -0.539 | -0.034 | -0.002 |
| -1.25000000000008 | -0.566 | -0.034 | -0.002 |
| -1.24500000000008 | -0.595 | -0.033 | -0.002 |
| -1.24000000000008 | -0.626 | -0.033 | -0.002 |
| -1.23500000000008 | -0.66 | -0.033 | -0.002 |
| -1.23000000000008 | -0.696 | -0.032 | -0.002 |
| -1.22500000000008 | -0.734 | -0.032 | -0.002 |
| -1.220000000000081 | -0.775 | -0.032 | -0.002 |
| -1.215000000000081 | -0.82 | -0.031 | -0.002 |
| -1.210000000000081 | -0.868 | -0.031 | -0.002 |
| -1.205000000000081 | -0.92 | -0.031 | -0.002 |
| -1.200000000000081 | -0.976 | -0.031 | -0.002 |
| -1.195000000000081 | -1.038 | -0.03 | -0.002 |
| -1.190000000000081 | -1.104 | -0.03 | -0.002 |
| -1.185000000000081 | -1.177 | -0.03 | -0.002 |
| -1.180000000000081 | -1.256 | -0.029 | -0.002 |
| -1.175000000000082 | -1.342 | -0.029 | -0.002 |
| -1.170000000000082 | -1.438 | -0.029 | -0.002 |
| -1.165000000000082 | -1.542 | -0.029 | -0.002 |
| -1.160000000000082 | -1.657 | -0.028 | -0.002 |
| -1.155000000000082 | -1.785 | -0.028 | -0.002 |
| -1.150000000000082 | -1.926 | -0.028 | -0.002 |
| -1.145000000000082 | -2.084 | -0.028 | -0.002 |
| -1.140000000000082 | -2.26 | -0.027 | -0.002 |
| -1.135000000000082 | -2.457 | -0.027 | -0.002 |
| -1.130000000000082 | -2.678 | -0.027 | -0.002 |
| -1.125000000000083 | -2.929 | -0.027 | -0.002 |
| -1.120000000000083 | -3.214 | -0.026 | -0.002 |
| -1.115000000000083 | -3.539 | -0.026 | -0.002 |
| -1.110000000000083 | -3.912 | -0.026 | -0.002 |
| -1.105000000000083 | -4.342 | -0.026 | -0.002 |
| -1.100000000000083 | -4.842 | -0.025 | -0.002 |
| -1.095000000000083 | -5.428 | -0.025 | -0.002 |
| -1.090000000000083 | -6.118 | -0.025 | -0.002 |
| -1.085000000000083 | -6.94 | -0.025 | -0.002 |
| -1.080000000000084 | -7.928 | -0.024 | -0.002 |
| -1.075000000000084 | -9.129 | -0.024 | -0.002 |
| -1.070000000000084 | -10.606 | -0.024 | -0.002 |
| -1.065000000000084 | -12.451 | -0.024 | -0.002 |
| -1.060000000000084 | -14.793 | -0.024 | -0.002 |
| -1.055000000000084 | -17.825 | -0.023 | -0.002 |
| -1.050000000000084 | -21.84 | -0.023 | -0.002 |
| -1.045000000000084 | -27.306 | -0.023 | -0.002 |
| -1.040000000000084 | -35.005 | -0.023 | -0.002 |
| -1.035000000000085 | -46.318 | -0.023 | -0.002 |
| -1.030000000000085 | -63.877 | -0.022 | -0.002 |
| -1.025000000000085 | -93.216 | -0.022 | -0.002 |
| -1.020000000000085 | -147.632 | -0.022 | -0.002 |
| -1.015000000000085 | -266.088 | -0.022 | -0.002 |
| -1.010000000000085 | -607.136 | -0.022 | -0.002 |
| -1.005000000000085 | -2463.515 | -0.021 | -0.002 |
| -1.000000000000085 | -8596805828369230218657792 | -0.021 | -0.002 |
| -0.995000000000085 | -2538.513 | -0.021 | -0.002 |
| -0.990000000000085 | -644.632 | -0.021 | -0.002 |
| -0.985000000000085 | -291.083 | -0.021 | -0.002 |
| -0.980000000000085 | -166.376 | -0.02 | -0.002 |
| -0.975000000000085 | -108.208 | -0.02 | -0.001 |
| -0.970000000000085 | -76.368 | -0.02 | -0.001 |
| -0.965000000000085 | -57.021 | -0.02 | -0.001 |
| -0.960000000000085 | -44.368 | -0.02 | -0.001 |
| -0.955000000000085 | -35.626 | -0.02 | -0.001 |
| -0.950000000000085 | -29.324 | -0.019 | -0.001 |
| -0.945000000000085 | -24.626 | -0.019 | -0.001 |
| -0.940000000000085 | -21.025 | -0.019 | -0.001 |
| -0.935000000000085 | -18.2 | -0.019 | -0.001 |
| -0.930000000000085 | -15.942 | -0.019 | -0.001 |
| -0.925000000000085 | -14.105 | -0.019 | -0.001 |
| -0.920000000000085 | -12.591 | -0.018 | -0.001 |
| -0.915000000000085 | -11.325 | -0.018 | -0.001 |
| -0.910000000000085 | -10.257 | -0.018 | -0.001 |
| -0.905000000000085 | -9.345 | -0.018 | -0.001 |
| -0.900000000000085 | -8.561 | -0.018 | -0.001 |
| -0.895000000000085 | -7.881 | -0.018 | -0.001 |
| -0.890000000000085 | -7.286 | -0.018 | -0.001 |
| -0.885000000000085 | -6.764 | -0.017 | -0.001 |
| -0.880000000000085 | -6.301 | -0.017 | -0.001 |
| -0.875000000000085 | -5.89 | -0.017 | -0.001 |
| -0.870000000000085 | -5.522 | -0.017 | -0.001 |
| -0.865000000000085 | -5.192 | -0.017 | -0.001 |
| -0.860000000000085 | -4.894 | -0.017 | -0.001 |
| -0.855000000000085 | -4.624 | -0.016 | -0.001 |
| -0.850000000000085 | -4.379 | -0.016 | -0.001 |
| -0.845000000000085 | -4.156 | -0.016 | -0.001 |
| -0.840000000000085 | -3.951 | -0.016 | -0.001 |
| -0.835000000000085 | -3.763 | -0.016 | -0.001 |
| -0.830000000000085 | -3.59 | -0.016 | -0.001 |
| -0.825000000000085 | -3.43 | -0.016 | -0.001 |
| -0.820000000000085 | -3.283 | -0.016 | -0.001 |
| -0.815000000000085 | -3.146 | -0.015 | -0.001 |
| -0.810000000000085 | -3.018 | -0.015 | -0.001 |
| -0.805000000000085 | -2.899 | -0.015 | -0.001 |
| -0.800000000000085 | -2.789 | -0.015 | -0.001 |
| -0.795000000000085 | -2.685 | -0.015 | -0.001 |
| -0.790000000000085 | -2.588 | -0.015 | -0.001 |
| -0.785000000000085 | -2.496 | -0.015 | -0.001 |
| -0.780000000000085 | -2.411 | -0.014 | -0.001 |
| -0.775000000000085 | -2.33 | -0.014 | -0.001 |
| -0.770000000000085 | -2.253 | -0.014 | -0.001 |
| -0.765000000000085 | -2.181 | -0.014 | -0.001 |
| -0.760000000000085 | -2.113 | -0.014 | -0.001 |
| -0.755000000000085 | -2.049 | -0.014 | -0.001 |
| -0.750000000000085 | -1.987 | -0.014 | -0.001 |
| -0.745000000000085 | -1.929 | -0.014 | -0.001 |
| -0.740000000000085 | -1.874 | -0.013 | -0.001 |
| -0.735000000000085 | -1.821 | -0.013 | -0.001 |
| -0.730000000000085 | -1.771 | -0.013 | -0.001 |
| -0.725000000000085 | -1.723 | -0.013 | -0.001 |
| -0.720000000000085 | -1.677 | -0.013 | -0.001 |
| -0.715000000000085 | -1.633 | -0.013 | -0.001 |
| -0.710000000000085 | -1.591 | -0.013 | -0.001 |
| -0.705000000000085 | -1.551 | -0.013 | -0.001 |
| -0.700000000000085 | -1.513 | -0.013 | -0.001 |
| -0.695000000000085 | -1.476 | -0.012 | -0.001 |
| -0.690000000000085 | -1.44 | -0.012 | -0.001 |
| -0.685000000000085 | -1.406 | -0.012 | -0.001 |
| -0.680000000000085 | -1.373 | -0.012 | -0.001 |
| -0.675000000000085 | -1.342 | -0.012 | -0.001 |
| -0.670000000000085 | -1.311 | -0.012 | -0.001 |
| -0.665000000000085 | -1.282 | -0.012 | -0.001 |
| -0.660000000000085 | -1.254 | -0.012 | -0.001 |
| -0.655000000000085 | -1.226 | -0.011 | -0.001 |
| -0.650000000000085 | -1.2 | -0.011 | -0.001 |
| -0.645000000000085 | -1.175 | -0.011 | -0.001 |
| -0.640000000000085 | -1.15 | -0.011 | -0.001 |
| -0.635000000000085 | -1.126 | -0.011 | -0.001 |
| -0.630000000000085 | -1.103 | -0.011 | -0.001 |
| -0.625000000000085 | -1.08 | -0.011 | -0.001 |
| -0.620000000000085 | -1.059 | -0.011 | -0.001 |
| -0.615000000000085 | -1.037 | -0.011 | -0.001 |
| -0.610000000000085 | -1.017 | -0.011 | -0.001 |
| -0.605000000000085 | -0.997 | -0.01 | -0.001 |
| -0.600000000000085 | -0.978 | -0.01 | -0.001 |
| -0.595000000000085 | -0.959 | -0.01 | -0.001 |
| -0.590000000000085 | -0.941 | -0.01 | -0.001 |
| -0.585000000000085 | -0.923 | -0.01 | -0.001 |
| -0.580000000000085 | -0.905 | -0.01 | -0.001 |
| -0.575000000000085 | -0.889 | -0.01 | -0.001 |
| -0.570000000000085 | -0.872 | -0.01 | -0.001 |
| -0.565000000000085 | -0.856 | -0.01 | -0.001 |
| -0.560000000000085 | -0.84 | -0.01 | -0.001 |
| -0.555000000000085 | -0.825 | -0.009 | -0.001 |
| -0.550000000000085 | -0.81 | -0.009 | -0.001 |
| -0.545000000000085 | -0.796 | -0.009 | -0.001 |
| -0.540000000000085 | -0.781 | -0.009 | -0.001 |
| -0.535000000000085 | -0.768 | -0.009 | -0.001 |
| -0.530000000000085 | -0.754 | -0.009 | -0.001 |
| -0.525000000000085 | -0.741 | -0.009 | -0.001 |
| -0.520000000000085 | -0.728 | -0.009 | -0.001 |
| -0.515000000000085 | -0.715 | -0.009 | -0.001 |
| -0.510000000000085 | -0.702 | -0.009 | -0.001 |
| -0.505000000000085 | -0.69 | -0.008 | -0.001 |
| -0.500000000000085 | -0.678 | -0.008 | -0.001 |
| -0.495000000000085 | -0.666 | -0.008 | -0.001 |
| -0.490000000000085 | -0.655 | -0.008 | -0.001 |
| -0.485000000000085 | -0.644 | -0.008 | -0.001 |
| -0.480000000000085 | -0.633 | -0.008 | -0.001 |
| -0.475000000000085 | -0.622 | -0.008 | -0.001 |
| -0.470000000000085 | -0.611 | -0.008 | -0.001 |
| -0.465000000000085 | -0.601 | -0.008 | -0.001 |
| -0.460000000000085 | -0.59 | -0.008 | -0.001 |
| -0.455000000000085 | -0.58 | -0.008 | -0.001 |
| -0.450000000000085 | -0.57 | -0.007 | -0.001 |
| -0.445000000000085 | -0.56 | -0.007 | -0.001 |
| -0.440000000000085 | -0.551 | -0.007 | -0.001 |
| -0.435000000000085 | -0.541 | -0.007 | -0.001 |
| -0.430000000000085 | -0.532 | -0.007 | -0.001 |
| -0.425000000000085 | -0.523 | -0.007 | -0.001 |
| -0.420000000000085 | -0.514 | -0.007 | -0.001 |
| -0.415000000000085 | -0.505 | -0.007 | -0.001 |
| -0.410000000000085 | -0.496 | -0.007 | -0.001 |
| -0.405000000000085 | -0.488 | -0.007 | -0.001 |
| -0.400000000000085 | -0.479 | -0.007 | -0.001 |
| -0.395000000000085 | -0.471 | -0.006 | -0.001 |
| -0.390000000000085 | -0.463 | -0.006 | -0.001 |
| -0.385000000000085 | -0.454 | -0.006 | -0.001 |
| -0.380000000000085 | -0.446 | -0.006 | -0.001 |
| -0.375000000000085 | -0.438 | -0.006 | -0.001 |
| -0.370000000000085 | -0.431 | -0.006 | -0.001 |
| -0.365000000000085 | -0.423 | -0.006 | -0.001 |
| -0.360000000000085 | -0.415 | -0.006 | -0.001 |
| -0.355000000000085 | -0.408 | -0.006 | 0 |
| -0.350000000000085 | -0.4 | -0.006 | 0 |
| -0.345000000000085 | -0.393 | -0.006 | 0 |
| -0.340000000000085 | -0.386 | -0.005 | 0 |
| -0.335000000000085 | -0.378 | -0.005 | 0 |
| -0.330000000000085 | -0.371 | -0.005 | 0 |
| -0.325000000000085 | -0.364 | -0.005 | 0 |
| -0.320000000000085 | -0.357 | -0.005 | 0 |
| -0.315000000000085 | -0.35 | -0.005 | 0 |
| -0.310000000000085 | -0.344 | -0.005 | 0 |
| -0.305000000000085 | -0.337 | -0.005 | 0 |
| -0.300000000000085 | -0.33 | -0.005 | 0 |
| -0.295000000000085 | -0.324 | -0.005 | 0 |
| -0.290000000000085 | -0.317 | -0.005 | 0 |
| -0.285000000000085 | -0.311 | -0.005 | 0 |
| -0.280000000000085 | -0.304 | -0.004 | 0 |
| -0.275000000000085 | -0.298 | -0.004 | 0 |
| -0.270000000000085 | -0.292 | -0.004 | 0 |
| -0.265000000000085 | -0.285 | -0.004 | 0 |
| -0.260000000000085 | -0.279 | -0.004 | 0 |
| -0.255000000000085 | -0.273 | -0.004 | 0 |
| -0.250000000000085 | -0.267 | -0.004 | 0 |
| -0.245000000000085 | -0.261 | -0.004 | 0 |
| -0.240000000000085 | -0.255 | -0.004 | 0 |
| -0.235000000000085 | -0.249 | -0.004 | 0 |
| -0.230000000000085 | -0.243 | -0.004 | 0 |
| -0.225000000000085 | -0.237 | -0.004 | 0 |
| -0.220000000000085 | -0.231 | -0.003 | 0 |
| -0.215000000000085 | -0.226 | -0.003 | 0 |
| -0.210000000000085 | -0.22 | -0.003 | 0 |
| -0.205000000000085 | -0.214 | -0.003 | 0 |
| -0.200000000000085 | -0.208 | -0.003 | 0 |
| -0.195000000000085 | -0.203 | -0.003 | 0 |
| -0.190000000000085 | -0.197 | -0.003 | 0 |
| -0.185000000000085 | -0.192 | -0.003 | 0 |
| -0.180000000000085 | -0.186 | -0.003 | 0 |
| -0.175000000000085 | -0.181 | -0.003 | 0 |
| -0.170000000000085 | -0.175 | -0.003 | 0 |
| -0.165000000000085 | -0.17 | -0.003 | 0 |
| -0.160000000000085 | -0.164 | -0.003 | 0 |
| -0.155000000000084 | -0.159 | -0.002 | 0 |
| -0.150000000000084 | -0.153 | -0.002 | 0 |
| -0.145000000000084 | -0.148 | -0.002 | 0 |
| -0.140000000000084 | -0.143 | -0.002 | 0 |
| -0.135000000000084 | -0.138 | -0.002 | 0 |
| -0.130000000000084 | -0.132 | -0.002 | 0 |
| -0.125000000000084 | -0.127 | -0.002 | 0 |
| -0.120000000000084 | -0.122 | -0.002 | 0 |
| -0.115000000000084 | -0.117 | -0.002 | 0 |
| -0.110000000000084 | -0.111 | -0.002 | 0 |
| -0.105000000000084 | -0.106 | -0.002 | 0 |
| -0.100000000000084 | -0.101 | -0.002 | 0 |
| -0.0950000000000844 | -0.096 | -0.001 | 0 |
| -0.0900000000000844 | -0.091 | -0.001 | 0 |
| -0.0850000000000844 | -0.086 | -0.001 | 0 |
| -0.0800000000000844 | -0.081 | -0.001 | 0 |
| -0.0750000000000844 | -0.075 | -0.001 | 0 |
| -0.0700000000000844 | -0.07 | -0.001 | 0 |
| -0.0650000000000844 | -0.065 | -0.001 | 0 |
| -0.0600000000000844 | -0.06 | -0.001 | 0 |
| -0.0550000000000844 | -0.055 | -0.001 | 0 |
| -0.0500000000000844 | -0.05 | -0.001 | 0 |
| -0.0450000000000844 | -0.045 | -0.001 | 0 |
| -0.0400000000000844 | -0.04 | -0.001 | 0 |
| -0.0350000000000844 | -0.035 | -0.001 | 0 |
| -0.0300000000000844 | -0.03 | 0 | 0 |
| -0.0250000000000844 | -0.025 | 0 | 0 |
| -0.0200000000000844 | -0.02 | 0 | 0 |
| -0.0150000000000844 | -0.015 | 0 | 0 |
| -0.0100000000000844 | -0.01 | 0 | 0 |
| -0.00500000000008444 | -0.005 | 0 | 0 |
| -8.4444604087075e-14 | 0 | 0 | 0 |
| 0.00499999999991555 | 0.005 | 0 | 0 |
| 0.00999999999991555 | 0.01 | 0 | 0 |
| 0.0149999999999156 | 0.015 | 0 | 0 |
| 0.0199999999999156 | 0.02 | 0 | 0 |
| 0.0249999999999156 | 0.025 | 0 | 0 |
| 0.0299999999999156 | 0.03 | 0 | 0 |
| 0.0349999999999155 | 0.035 | 0.001 | 0 |
| 0.0399999999999155 | 0.04 | 0.001 | 0 |
| 0.0449999999999155 | 0.045 | 0.001 | 0 |
| 0.0499999999999155 | 0.05 | 0.001 | 0 |
| 0.0549999999999155 | 0.055 | 0.001 | 0 |
| 0.0599999999999155 | 0.06 | 0.001 | 0 |
| 0.0649999999999155 | 0.065 | 0.001 | 0 |
| 0.0699999999999155 | 0.07 | 0.001 | 0 |
| 0.0749999999999155 | 0.075 | 0.001 | 0 |
| 0.0799999999999155 | 0.081 | 0.001 | 0 |
| 0.0849999999999155 | 0.086 | 0.001 | 0 |
| 0.0899999999999155 | 0.091 | 0.001 | 0 |
| 0.0949999999999155 | 0.096 | 0.001 | 0 |
| 0.0999999999999155 | 0.101 | 0.002 | 0 |
| 0.104999999999916 | 0.106 | 0.002 | 0 |
| 0.109999999999916 | 0.111 | 0.002 | 0 |
| 0.114999999999916 | 0.117 | 0.002 | 0 |
| 0.119999999999916 | 0.122 | 0.002 | 0 |
| 0.124999999999916 | 0.127 | 0.002 | 0 |
| 0.129999999999916 | 0.132 | 0.002 | 0 |
| 0.134999999999916 | 0.138 | 0.002 | 0 |
| 0.139999999999916 | 0.143 | 0.002 | 0 |
| 0.144999999999916 | 0.148 | 0.002 | 0 |
| 0.149999999999916 | 0.153 | 0.002 | 0 |
| 0.154999999999916 | 0.159 | 0.002 | 0 |
| 0.159999999999916 | 0.164 | 0.003 | 0 |
| 0.164999999999916 | 0.17 | 0.003 | 0 |
| 0.169999999999916 | 0.175 | 0.003 | 0 |
| 0.174999999999916 | 0.181 | 0.003 | 0 |
| 0.179999999999916 | 0.186 | 0.003 | 0 |
| 0.184999999999916 | 0.192 | 0.003 | 0 |
| 0.189999999999916 | 0.197 | 0.003 | 0 |
| 0.194999999999916 | 0.203 | 0.003 | 0 |
| 0.199999999999916 | 0.208 | 0.003 | 0 |
| 0.204999999999916 | 0.214 | 0.003 | 0 |
| 0.209999999999916 | 0.22 | 0.003 | 0 |
| 0.214999999999916 | 0.226 | 0.003 | 0 |
| 0.219999999999916 | 0.231 | 0.003 | 0 |
| 0.224999999999916 | 0.237 | 0.004 | 0 |
| 0.229999999999916 | 0.243 | 0.004 | 0 |
| 0.234999999999916 | 0.249 | 0.004 | 0 |
| 0.239999999999916 | 0.255 | 0.004 | 0 |
| 0.244999999999916 | 0.261 | 0.004 | 0 |
| 0.249999999999916 | 0.267 | 0.004 | 0 |
| 0.254999999999916 | 0.273 | 0.004 | 0 |
| 0.259999999999916 | 0.279 | 0.004 | 0 |
| 0.264999999999916 | 0.285 | 0.004 | 0 |
| 0.269999999999916 | 0.292 | 0.004 | 0 |
| 0.274999999999916 | 0.298 | 0.004 | 0 |
| 0.279999999999916 | 0.304 | 0.004 | 0 |
| 0.284999999999916 | 0.311 | 0.005 | 0 |
| 0.289999999999916 | 0.317 | 0.005 | 0 |
| 0.294999999999916 | 0.324 | 0.005 | 0 |
| 0.299999999999916 | 0.33 | 0.005 | 0 |
| 0.304999999999916 | 0.337 | 0.005 | 0 |
| 0.309999999999916 | 0.344 | 0.005 | 0 |
| 0.314999999999916 | 0.35 | 0.005 | 0 |
| 0.319999999999916 | 0.357 | 0.005 | 0 |
| 0.324999999999916 | 0.364 | 0.005 | 0 |
| 0.329999999999916 | 0.371 | 0.005 | 0 |
| 0.334999999999916 | 0.378 | 0.005 | 0 |
| 0.339999999999916 | 0.386 | 0.005 | 0 |
| 0.344999999999916 | 0.393 | 0.006 | 0 |
| 0.349999999999916 | 0.4 | 0.006 | 0 |
| 0.354999999999916 | 0.408 | 0.006 | 0 |
| 0.359999999999916 | 0.415 | 0.006 | 0.001 |
| 0.364999999999916 | 0.423 | 0.006 | 0.001 |
| 0.369999999999916 | 0.431 | 0.006 | 0.001 |
| 0.374999999999916 | 0.438 | 0.006 | 0.001 |
| 0.379999999999916 | 0.446 | 0.006 | 0.001 |
| 0.384999999999916 | 0.454 | 0.006 | 0.001 |
| 0.389999999999916 | 0.463 | 0.006 | 0.001 |
| 0.394999999999916 | 0.471 | 0.006 | 0.001 |
| 0.399999999999916 | 0.479 | 0.007 | 0.001 |
| 0.404999999999916 | 0.488 | 0.007 | 0.001 |
| 0.409999999999916 | 0.496 | 0.007 | 0.001 |
| 0.414999999999916 | 0.505 | 0.007 | 0.001 |
| 0.419999999999916 | 0.514 | 0.007 | 0.001 |
| 0.424999999999916 | 0.523 | 0.007 | 0.001 |
| 0.429999999999916 | 0.532 | 0.007 | 0.001 |
| 0.434999999999916 | 0.541 | 0.007 | 0.001 |
| 0.439999999999916 | 0.551 | 0.007 | 0.001 |
| 0.444999999999916 | 0.56 | 0.007 | 0.001 |
| 0.449999999999916 | 0.57 | 0.007 | 0.001 |
| 0.454999999999916 | 0.58 | 0.008 | 0.001 |
| 0.459999999999916 | 0.59 | 0.008 | 0.001 |
| 0.464999999999916 | 0.601 | 0.008 | 0.001 |
| 0.469999999999916 | 0.611 | 0.008 | 0.001 |
| 0.474999999999916 | 0.622 | 0.008 | 0.001 |
| 0.479999999999916 | 0.633 | 0.008 | 0.001 |
| 0.484999999999916 | 0.644 | 0.008 | 0.001 |
| 0.489999999999916 | 0.655 | 0.008 | 0.001 |
| 0.494999999999916 | 0.666 | 0.008 | 0.001 |
| 0.499999999999916 | 0.678 | 0.008 | 0.001 |
| 0.504999999999916 | 0.69 | 0.008 | 0.001 |
| 0.509999999999916 | 0.702 | 0.009 | 0.001 |
| 0.514999999999916 | 0.715 | 0.009 | 0.001 |
| 0.519999999999916 | 0.728 | 0.009 | 0.001 |
| 0.524999999999916 | 0.741 | 0.009 | 0.001 |
| 0.529999999999916 | 0.754 | 0.009 | 0.001 |
| 0.534999999999916 | 0.768 | 0.009 | 0.001 |
| 0.539999999999916 | 0.781 | 0.009 | 0.001 |
| 0.544999999999916 | 0.796 | 0.009 | 0.001 |
| 0.549999999999916 | 0.81 | 0.009 | 0.001 |
| 0.554999999999916 | 0.825 | 0.009 | 0.001 |
| 0.559999999999916 | 0.84 | 0.01 | 0.001 |
| 0.564999999999916 | 0.856 | 0.01 | 0.001 |
| 0.569999999999916 | 0.872 | 0.01 | 0.001 |
| 0.574999999999916 | 0.889 | 0.01 | 0.001 |
| 0.579999999999916 | 0.905 | 0.01 | 0.001 |
| 0.584999999999916 | 0.923 | 0.01 | 0.001 |
| 0.589999999999916 | 0.941 | 0.01 | 0.001 |
| 0.594999999999916 | 0.959 | 0.01 | 0.001 |
| 0.599999999999916 | 0.978 | 0.01 | 0.001 |
| 0.604999999999916 | 0.997 | 0.01 | 0.001 |
| 0.609999999999916 | 1.017 | 0.011 | 0.001 |
| 0.614999999999916 | 1.037 | 0.011 | 0.001 |
| 0.619999999999916 | 1.059 | 0.011 | 0.001 |
| 0.624999999999916 | 1.08 | 0.011 | 0.001 |
| 0.629999999999916 | 1.103 | 0.011 | 0.001 |
| 0.634999999999916 | 1.126 | 0.011 | 0.001 |
| 0.639999999999916 | 1.15 | 0.011 | 0.001 |
| 0.644999999999916 | 1.175 | 0.011 | 0.001 |
| 0.649999999999916 | 1.2 | 0.011 | 0.001 |
| 0.654999999999916 | 1.226 | 0.011 | 0.001 |
| 0.659999999999916 | 1.254 | 0.012 | 0.001 |
| 0.664999999999916 | 1.282 | 0.012 | 0.001 |
| 0.669999999999916 | 1.311 | 0.012 | 0.001 |
| 0.674999999999916 | 1.342 | 0.012 | 0.001 |
| 0.679999999999916 | 1.373 | 0.012 | 0.001 |
| 0.684999999999916 | 1.406 | 0.012 | 0.001 |
| 0.689999999999916 | 1.44 | 0.012 | 0.001 |
| 0.694999999999916 | 1.476 | 0.012 | 0.001 |
| 0.699999999999916 | 1.513 | 0.013 | 0.001 |
| 0.704999999999916 | 1.551 | 0.013 | 0.001 |
| 0.709999999999916 | 1.591 | 0.013 | 0.001 |
| 0.714999999999916 | 1.633 | 0.013 | 0.001 |
| 0.719999999999916 | 1.677 | 0.013 | 0.001 |
| 0.724999999999916 | 1.723 | 0.013 | 0.001 |
| 0.729999999999916 | 1.771 | 0.013 | 0.001 |
| 0.734999999999916 | 1.821 | 0.013 | 0.001 |
| 0.739999999999916 | 1.874 | 0.013 | 0.001 |
| 0.744999999999916 | 1.929 | 0.014 | 0.001 |
| 0.749999999999916 | 1.987 | 0.014 | 0.001 |
| 0.754999999999916 | 2.049 | 0.014 | 0.001 |
| 0.759999999999916 | 2.113 | 0.014 | 0.001 |
| 0.764999999999916 | 2.181 | 0.014 | 0.001 |
| 0.769999999999916 | 2.253 | 0.014 | 0.001 |
| 0.774999999999916 | 2.33 | 0.014 | 0.001 |
| 0.779999999999916 | 2.411 | 0.014 | 0.001 |
| 0.784999999999916 | 2.496 | 0.015 | 0.001 |
| 0.789999999999916 | 2.588 | 0.015 | 0.001 |
| 0.794999999999916 | 2.685 | 0.015 | 0.001 |
| 0.799999999999916 | 2.789 | 0.015 | 0.001 |
| 0.804999999999916 | 2.899 | 0.015 | 0.001 |
| 0.809999999999916 | 3.018 | 0.015 | 0.001 |
| 0.814999999999916 | 3.146 | 0.015 | 0.001 |
| 0.819999999999916 | 3.283 | 0.016 | 0.001 |
| 0.824999999999916 | 3.43 | 0.016 | 0.001 |
| 0.829999999999916 | 3.59 | 0.016 | 0.001 |
| 0.834999999999916 | 3.763 | 0.016 | 0.001 |
| 0.839999999999916 | 3.951 | 0.016 | 0.001 |
| 0.844999999999916 | 4.156 | 0.016 | 0.001 |
| 0.849999999999916 | 4.379 | 0.016 | 0.001 |
| 0.854999999999916 | 4.624 | 0.016 | 0.001 |
| 0.859999999999916 | 4.894 | 0.017 | 0.001 |
| 0.864999999999916 | 5.192 | 0.017 | 0.001 |
| 0.869999999999916 | 5.522 | 0.017 | 0.001 |
| 0.874999999999916 | 5.89 | 0.017 | 0.001 |
| 0.879999999999916 | 6.301 | 0.017 | 0.001 |
| 0.884999999999916 | 6.764 | 0.017 | 0.001 |
| 0.889999999999916 | 7.286 | 0.018 | 0.001 |
| 0.894999999999916 | 7.881 | 0.018 | 0.001 |
| 0.899999999999916 | 8.561 | 0.018 | 0.001 |
| 0.904999999999916 | 9.345 | 0.018 | 0.001 |
| 0.909999999999916 | 10.257 | 0.018 | 0.001 |
| 0.914999999999916 | 11.325 | 0.018 | 0.001 |
| 0.919999999999916 | 12.591 | 0.018 | 0.001 |
| 0.924999999999916 | 14.105 | 0.019 | 0.001 |
| 0.929999999999916 | 15.942 | 0.019 | 0.001 |
| 0.934999999999916 | 18.2 | 0.019 | 0.001 |
| 0.939999999999916 | 21.025 | 0.019 | 0.001 |
| 0.944999999999916 | 24.626 | 0.019 | 0.001 |
| 0.949999999999916 | 29.324 | 0.019 | 0.001 |
| 0.954999999999916 | 35.626 | 0.02 | 0.001 |
| 0.959999999999916 | 44.368 | 0.02 | 0.001 |
| 0.964999999999916 | 57.021 | 0.02 | 0.001 |
| 0.969999999999916 | 76.368 | 0.02 | 0.001 |
| 0.974999999999916 | 108.208 | 0.02 | 0.001 |
| 0.979999999999916 | 166.376 | 0.02 | 0.002 |
| 0.984999999999916 | 291.083 | 0.021 | 0.002 |
| 0.989999999999916 | 644.632 | 0.021 | 0.002 |
| 0.994999999999916 | 2538.513 | 0.021 | 0.002 |
| 0.999999999999916 | 8919014418088090115506176 | 0.021 | 0.002 |
| 1.004999999999916 | 2463.515 | 0.021 | 0.002 |
| 1.009999999999916 | 607.136 | 0.022 | 0.002 |
| 1.014999999999916 | 266.088 | 0.022 | 0.002 |
| 1.019999999999916 | 147.632 | 0.022 | 0.002 |
| 1.024999999999916 | 93.216 | 0.022 | 0.002 |
| 1.029999999999916 | 63.877 | 0.022 | 0.002 |
| 1.034999999999916 | 46.318 | 0.023 | 0.002 |
| 1.039999999999915 | 35.005 | 0.023 | 0.002 |
| 1.044999999999915 | 27.306 | 0.023 | 0.002 |
| 1.049999999999915 | 21.84 | 0.023 | 0.002 |
| 1.054999999999915 | 17.825 | 0.023 | 0.002 |
| 1.059999999999915 | 14.793 | 0.024 | 0.002 |
| 1.064999999999915 | 12.451 | 0.024 | 0.002 |
| 1.069999999999915 | 10.606 | 0.024 | 0.002 |
| 1.074999999999915 | 9.129 | 0.024 | 0.002 |
| 1.079999999999915 | 7.928 | 0.024 | 0.002 |
| 1.084999999999914 | 6.94 | 0.025 | 0.002 |
| 1.089999999999914 | 6.118 | 0.025 | 0.002 |
| 1.094999999999914 | 5.428 | 0.025 | 0.002 |
| 1.099999999999914 | 4.842 | 0.025 | 0.002 |
| 1.104999999999914 | 4.342 | 0.026 | 0.002 |
| 1.109999999999914 | 3.912 | 0.026 | 0.002 |
| 1.114999999999914 | 3.539 | 0.026 | 0.002 |
| 1.119999999999914 | 3.214 | 0.026 | 0.002 |
| 1.124999999999914 | 2.929 | 0.027 | 0.002 |
| 1.129999999999914 | 2.678 | 0.027 | 0.002 |
| 1.134999999999913 | 2.457 | 0.027 | 0.002 |
| 1.139999999999913 | 2.26 | 0.027 | 0.002 |
| 1.144999999999913 | 2.084 | 0.028 | 0.002 |
| 1.149999999999913 | 1.926 | 0.028 | 0.002 |
| 1.154999999999913 | 1.785 | 0.028 | 0.002 |
| 1.159999999999913 | 1.657 | 0.028 | 0.002 |
| 1.164999999999913 | 1.542 | 0.029 | 0.002 |
| 1.169999999999913 | 1.438 | 0.029 | 0.002 |
| 1.174999999999913 | 1.342 | 0.029 | 0.002 |
| 1.179999999999912 | 1.256 | 0.029 | 0.002 |
| 1.184999999999912 | 1.177 | 0.03 | 0.002 |
| 1.189999999999912 | 1.104 | 0.03 | 0.002 |
| 1.194999999999912 | 1.038 | 0.03 | 0.002 |
| 1.199999999999912 | 0.976 | 0.031 | 0.002 |
| 1.204999999999912 | 0.92 | 0.031 | 0.002 |
| 1.209999999999912 | 0.868 | 0.031 | 0.002 |
| 1.214999999999912 | 0.82 | 0.031 | 0.002 |
| 1.219999999999912 | 0.775 | 0.032 | 0.002 |
| 1.224999999999911 | 0.734 | 0.032 | 0.002 |
| 1.229999999999911 | 0.696 | 0.032 | 0.002 |
| 1.234999999999911 | 0.66 | 0.033 | 0.002 |
| 1.239999999999911 | 0.626 | 0.033 | 0.002 |
| 1.244999999999911 | 0.595 | 0.033 | 0.002 |
| 1.249999999999911 | 0.566 | 0.034 | 0.002 |
| 1.254999999999911 | 0.539 | 0.034 | 0.002 |
| 1.259999999999911 | 0.514 | 0.034 | 0.002 |
| 1.264999999999911 | 0.49 | 0.035 | 0.002 |
| 1.269999999999911 | 0.467 | 0.035 | 0.002 |
| 1.27499999999991 | 0.446 | 0.036 | 0.002 |
| 1.27999999999991 | 0.427 | 0.036 | 0.002 |
| 1.28499999999991 | 0.408 | 0.036 | 0.002 |
| 1.28999999999991 | 0.39 | 0.037 | 0.002 |
| 1.29499999999991 | 0.374 | 0.037 | 0.002 |
| 1.29999999999991 | 0.358 | 0.038 | 0.002 |
| 1.30499999999991 | 0.343 | 0.038 | 0.002 |
| 1.30999999999991 | 0.329 | 0.038 | 0.002 |
| 1.31499999999991 | 0.316 | 0.039 | 0.002 |
| 1.319999999999909 | 0.303 | 0.039 | 0.002 |
| 1.324999999999909 | 0.292 | 0.04 | 0.002 |
| 1.329999999999909 | 0.28 | 0.04 | 0.002 |
| 1.334999999999909 | 0.27 | 0.041 | 0.002 |
| 1.339999999999909 | 0.259 | 0.041 | 0.002 |
| 1.344999999999909 | 0.25 | 0.041 | 0.002 |
| 1.349999999999909 | 0.24 | 0.042 | 0.002 |
| 1.354999999999909 | 0.232 | 0.042 | 0.002 |
| 1.359999999999909 | 0.223 | 0.043 | 0.002 |
| 1.364999999999908 | 0.215 | 0.043 | 0.002 |
| 1.369999999999908 | 0.208 | 0.044 | 0.002 |
| 1.374999999999908 | 0.201 | 0.044 | 0.002 |
| 1.379999999999908 | 0.194 | 0.045 | 0.002 |
| 1.384999999999908 | 0.187 | 0.046 | 0.002 |
| 1.389999999999908 | 0.181 | 0.046 | 0.002 |
| 1.394999999999908 | 0.175 | 0.047 | 0.002 |
| 1.399999999999908 | 0.169 | 0.047 | 0.002 |
| 1.404999999999908 | 0.163 | 0.048 | 0.003 |
| 1.409999999999908 | 0.158 | 0.048 | 0.003 |
| 1.414999999999907 | 0.153 | 0.049 | 0.003 |
| 1.419999999999907 | 0.148 | 0.05 | 0.003 |
| 1.424999999999907 | 0.143 | 0.05 | 0.003 |
| 1.429999999999907 | 0.139 | 0.051 | 0.003 |
| 1.434999999999907 | 0.135 | 0.052 | 0.003 |
| 1.439999999999907 | 0.131 | 0.052 | 0.003 |
| 1.444999999999907 | 0.127 | 0.053 | 0.003 |
| 1.449999999999907 | 0.123 | 0.054 | 0.003 |
| 1.454999999999907 | 0.119 | 0.055 | 0.003 |
| 1.459999999999906 | 0.116 | 0.055 | 0.003 |
| 1.464999999999906 | 0.112 | 0.056 | 0.003 |
| 1.469999999999906 | 0.109 | 0.057 | 0.003 |
| 1.474999999999906 | 0.106 | 0.058 | 0.003 |
| 1.479999999999906 | 0.103 | 0.059 | 0.003 |
| 1.484999999999906 | 0.1 | 0.059 | 0.003 |
| 1.489999999999906 | 0.097 | 0.06 | 0.003 |
| 1.494999999999906 | 0.094 | 0.061 | 0.003 |
| 1.499999999999906 | 0.092 | 0.062 | 0.003 |
| 1.504999999999906 | 0.089 | 0.063 | 0.003 |
| 1.509999999999905 | 0.087 | 0.064 | 0.003 |
| 1.514999999999905 | 0.084 | 0.065 | 0.003 |
| 1.519999999999905 | 0.082 | 0.066 | 0.003 |
| 1.524999999999905 | 0.08 | 0.067 | 0.003 |
| 1.529999999999905 | 0.078 | 0.068 | 0.003 |
| 1.534999999999905 | 0.076 | 0.069 | 0.003 |
| 1.539999999999905 | 0.074 | 0.07 | 0.003 |
| 1.544999999999905 | 0.072 | 0.072 | 0.003 |
| 1.549999999999905 | 0.07 | 0.073 | 0.003 |
| 1.554999999999904 | 0.068 | 0.074 | 0.003 |
| 1.559999999999904 | 0.067 | 0.075 | 0.003 |
| 1.564999999999904 | 0.065 | 0.077 | 0.003 |
| 1.569999999999904 | 0.063 | 0.078 | 0.003 |
| 1.574999999999904 | 0.062 | 0.079 | 0.003 |
| 1.579999999999904 | 0.06 | 0.081 | 0.003 |
| 1.584999999999904 | 0.059 | 0.082 | 0.003 |
| 1.589999999999904 | 0.057 | 0.084 | 0.003 |
| 1.594999999999904 | 0.056 | 0.085 | 0.003 |
| 1.599999999999903 | 0.055 | 0.087 | 0.003 |
| 1.604999999999903 | 0.053 | 0.089 | 0.003 |
| 1.609999999999903 | 0.052 | 0.091 | 0.003 |
| 1.614999999999903 | 0.051 | 0.092 | 0.003 |
| 1.619999999999903 | 0.05 | 0.094 | 0.003 |
| 1.624999999999903 | 0.049 | 0.096 | 0.003 |
| 1.629999999999903 | 0.047 | 0.098 | 0.003 |
| 1.634999999999903 | 0.046 | 0.1 | 0.003 |
| 1.639999999999903 | 0.045 | 0.103 | 0.003 |
| 1.644999999999902 | 0.044 | 0.105 | 0.003 |
| 1.649999999999902 | 0.043 | 0.107 | 0.003 |
| 1.654999999999902 | 0.042 | 0.11 | 0.003 |
| 1.659999999999902 | 0.041 | 0.112 | 0.003 |
| 1.664999999999902 | 0.041 | 0.115 | 0.003 |
| 1.669999999999902 | 0.04 | 0.118 | 0.003 |
| 1.674999999999902 | 0.039 | 0.12 | 0.003 |
| 1.679999999999902 | 0.038 | 0.123 | 0.003 |
| 1.684999999999902 | 0.037 | 0.127 | 0.003 |
| 1.689999999999901 | 0.036 | 0.13 | 0.004 |
| 1.694999999999901 | 0.036 | 0.133 | 0.004 |
| 1.699999999999901 | 0.035 | 0.137 | 0.004 |
| 1.704999999999901 | 0.034 | 0.141 | 0.004 |
| 1.709999999999901 | 0.033 | 0.145 | 0.004 |
| 1.714999999999901 | 0.033 | 0.149 | 0.004 |
| 1.719999999999901 | 0.032 | 0.153 | 0.004 |
| 1.724999999999901 | 0.031 | 0.157 | 0.004 |
| 1.729999999999901 | 0.031 | 0.162 | 0.004 |
| 1.734999999999901 | 0.03 | 0.167 | 0.004 |
| 1.7399999999999 | 0.029 | 0.173 | 0.004 |
| 1.7449999999999 | 0.029 | 0.178 | 0.004 |
| 1.7499999999999 | 0.028 | 0.184 | 0.004 |
| 1.7549999999999 | 0.028 | 0.19 | 0.004 |
| 1.7599999999999 | 0.027 | 0.197 | 0.004 |
| 1.7649999999999 | 0.027 | 0.204 | 0.004 |
| 1.7699999999999 | 0.026 | 0.211 | 0.004 |
| 1.7749999999999 | 0.026 | 0.219 | 0.004 |
| 1.7799999999999 | 0.025 | 0.228 | 0.004 |
| 1.784999999999899 | 0.025 | 0.237 | 0.004 |
| 1.789999999999899 | 0.024 | 0.246 | 0.004 |
| 1.794999999999899 | 0.024 | 0.257 | 0.004 |
| 1.799999999999899 | 0.023 | 0.268 | 0.004 |
| 1.804999999999899 | 0.023 | 0.279 | 0.004 |
| 1.809999999999899 | 0.022 | 0.292 | 0.004 |
| 1.814999999999899 | 0.022 | 0.306 | 0.004 |
| 1.819999999999899 | 0.022 | 0.321 | 0.004 |
| 1.824999999999899 | 0.021 | 0.337 | 0.004 |
| 1.829999999999899 | 0.021 | 0.354 | 0.004 |
| 1.834999999999898 | 0.02 | 0.373 | 0.004 |
| 1.839999999999898 | 0.02 | 0.393 | 0.004 |
| 1.844999999999898 | 0.02 | 0.416 | 0.004 |
| 1.849999999999898 | 0.019 | 0.441 | 0.004 |
| 1.854999999999898 | 0.019 | 0.468 | 0.004 |
| 1.859999999999898 | 0.019 | 0.498 | 0.004 |
| 1.864999999999898 | 0.018 | 0.532 | 0.004 |
| 1.869999999999898 | 0.018 | 0.569 | 0.004 |
| 1.874999999999898 | 0.018 | 0.61 | 0.004 |
| 1.879999999999897 | 0.017 | 0.657 | 0.004 |
| 1.884999999999897 | 0.017 | 0.71 | 0.005 |
| 1.889999999999897 | 0.017 | 0.77 | 0.005 |
| 1.894999999999897 | 0.016 | 0.838 | 0.005 |
| 1.899999999999897 | 0.016 | 0.916 | 0.005 |
| 1.904999999999897 | 0.016 | 1.007 | 0.005 |
| 1.909999999999897 | 0.016 | 1.113 | 0.005 |
| 1.914999999999897 | 0.015 | 1.238 | 0.005 |
| 1.919999999999897 | 0.015 | 1.386 | 0.005 |
| 1.924999999999897 | 0.015 | 1.565 | 0.005 |
| 1.929999999999896 | 0.015 | 1.782 | 0.005 |
| 1.934999999999896 | 0.014 | 2.05 | 0.005 |
| 1.939999999999896 | 0.014 | 2.386 | 0.005 |
| 1.944999999999896 | 0.014 | 2.817 | 0.005 |
| 1.949999999999896 | 0.014 | 3.382 | 0.005 |
| 1.954999999999896 | 0.013 | 4.141 | 0.005 |
| 1.959999999999896 | 0.013 | 5.199 | 0.005 |
| 1.964999999999896 | 0.013 | 6.737 | 0.005 |
| 1.969999999999896 | 0.013 | 9.096 | 0.005 |
| 1.974999999999895 | 0.013 | 12.995 | 0.005 |
| 1.979999999999895 | 0.012 | 20.145 | 0.005 |
| 1.984999999999895 | 0.012 | 35.533 | 0.005 |
| 1.989999999999895 | 0.012 | 79.329 | 0.005 |
| 1.994999999999895 | 0.012 | 314.879 | 0.005 |
| 1.999999999999895 | 0.012 | 708251165600101999575040 | 0.005 |
| 2.004999999999895 | 0.011 | 310.192 | 0.005 |
| 2.009999999999895 | 0.011 | 76.985 | 0.005 |
| 2.014999999999895 | 0.011 | 33.97 | 0.005 |
| 2.019999999999895 | 0.011 | 18.973 | 0.005 |
| 2.024999999999895 | 0.011 | 12.058 | 0.006 |
| 2.029999999999895 | 0.01 | 8.315 | 0.006 |
| 2.034999999999894 | 0.01 | 6.067 | 0.006 |
| 2.039999999999894 | 0.01 | 4.614 | 0.006 |
| 2.044999999999894 | 0.01 | 3.621 | 0.006 |
| 2.049999999999894 | 0.01 | 2.913 | 0.006 |
| 2.054999999999894 | 0.01 | 2.391 | 0.006 |
| 2.059999999999894 | 0.01 | 1.996 | 0.006 |
| 2.064999999999894 | 0.009 | 1.69 | 0.006 |
| 2.069999999999894 | 0.009 | 1.447 | 0.006 |
| 2.074999999999894 | 0.009 | 1.253 | 0.006 |
| 2.079999999999893 | 0.009 | 1.094 | 0.006 |
| 2.084999999999893 | 0.009 | 0.963 | 0.006 |
| 2.089999999999893 | 0.009 | 0.853 | 0.006 |
| 2.094999999999893 | 0.009 | 0.761 | 0.006 |
| 2.099999999999893 | 0.008 | 0.682 | 0.006 |
| 2.104999999999893 | 0.008 | 0.615 | 0.006 |
| 2.109999999999893 | 0.008 | 0.557 | 0.006 |
| 2.114999999999893 | 0.008 | 0.506 | 0.006 |
| 2.119999999999893 | 0.008 | 0.462 | 0.006 |
| 2.124999999999893 | 0.008 | 0.423 | 0.006 |
| 2.129999999999892 | 0.008 | 0.389 | 0.007 |
| 2.134999999999892 | 0.008 | 0.359 | 0.007 |
| 2.139999999999892 | 0.008 | 0.331 | 0.007 |
| 2.144999999999892 | 0.007 | 0.307 | 0.007 |
| 2.149999999999892 | 0.007 | 0.285 | 0.007 |
| 2.154999999999892 | 0.007 | 0.266 | 0.007 |
| 2.159999999999892 | 0.007 | 0.248 | 0.007 |
| 2.164999999999892 | 0.007 | 0.232 | 0.007 |
| 2.169999999999892 | 0.007 | 0.217 | 0.007 |
| 2.174999999999891 | 0.007 | 0.203 | 0.007 |
| 2.179999999999891 | 0.007 | 0.191 | 0.007 |
| 2.184999999999891 | 0.007 | 0.18 | 0.007 |
| 2.189999999999891 | 0.007 | 0.17 | 0.007 |
| 2.194999999999891 | 0.006 | 0.16 | 0.007 |
| 2.199999999999891 | 0.006 | 0.151 | 0.007 |
| 2.204999999999891 | 0.006 | 0.143 | 0.007 |
| 2.209999999999891 | 0.006 | 0.136 | 0.008 |
| 2.214999999999891 | 0.006 | 0.129 | 0.008 |
| 2.21999999999989 | 0.006 | 0.122 | 0.008 |
| 2.22499999999989 | 0.006 | 0.116 | 0.008 |
| 2.22999999999989 | 0.006 | 0.111 | 0.008 |
| 2.23499999999989 | 0.006 | 0.105 | 0.008 |
| 2.23999999999989 | 0.006 | 0.1 | 0.008 |
| 2.24499999999989 | 0.006 | 0.096 | 0.008 |
| 2.24999999999989 | 0.006 | 0.092 | 0.008 |
| 2.25499999999989 | 0.005 | 0.087 | 0.008 |
| 2.25999999999989 | 0.005 | 0.084 | 0.008 |
| 2.26499999999989 | 0.005 | 0.08 | 0.008 |
| 2.269999999999889 | 0.005 | 0.077 | 0.009 |
| 2.274999999999889 | 0.005 | 0.074 | 0.009 |
| 2.279999999999889 | 0.005 | 0.071 | 0.009 |
| 2.284999999999889 | 0.005 | 0.068 | 0.009 |
| 2.289999999999889 | 0.005 | 0.065 | 0.009 |
| 2.294999999999889 | 0.005 | 0.063 | 0.009 |
| 2.299999999999889 | 0.005 | 0.06 | 0.009 |
| 2.304999999999889 | 0.005 | 0.058 | 0.009 |
| 2.309999999999889 | 0.005 | 0.056 | 0.009 |
| 2.314999999999888 | 0.005 | 0.054 | 0.009 |
| 2.319999999999888 | 0.005 | 0.052 | 0.009 |
| 2.324999999999888 | 0.005 | 0.05 | 0.01 |
| 2.329999999999888 | 0.004 | 0.048 | 0.01 |
| 2.334999999999888 | 0.004 | 0.047 | 0.01 |
| 2.339999999999888 | 0.004 | 0.045 | 0.01 |
| 2.344999999999888 | 0.004 | 0.043 | 0.01 |
| 2.349999999999888 | 0.004 | 0.042 | 0.01 |
| 2.354999999999888 | 0.004 | 0.041 | 0.01 |
| 2.359999999999887 | 0.004 | 0.039 | 0.01 |
| 2.364999999999887 | 0.004 | 0.038 | 0.011 |
| 2.369999999999887 | 0.004 | 0.037 | 0.011 |
| 2.374999999999887 | 0.004 | 0.036 | 0.011 |
| 2.379999999999887 | 0.004 | 0.035 | 0.011 |
| 2.384999999999887 | 0.004 | 0.033 | 0.011 |
| 2.389999999999887 | 0.004 | 0.032 | 0.011 |
| 2.394999999999887 | 0.004 | 0.031 | 0.011 |
| 2.399999999999887 | 0.004 | 0.031 | 0.011 |
| 2.404999999999887 | 0.004 | 0.03 | 0.012 |
| 2.409999999999886 | 0.004 | 0.029 | 0.012 |
| 2.414999999999886 | 0.004 | 0.028 | 0.012 |
| 2.419999999999886 | 0.004 | 0.027 | 0.012 |
| 2.424999999999886 | 0.004 | 0.026 | 0.012 |
| 2.429999999999886 | 0.004 | 0.026 | 0.012 |
| 2.434999999999886 | 0.003 | 0.025 | 0.013 |
| 2.439999999999886 | 0.003 | 0.024 | 0.013 |
| 2.444999999999886 | 0.003 | 0.024 | 0.013 |
| 2.449999999999886 | 0.003 | 0.023 | 0.013 |
| 2.454999999999885 | 0.003 | 0.022 | 0.013 |
| 2.459999999999885 | 0.003 | 0.022 | 0.014 |
| 2.464999999999885 | 0.003 | 0.021 | 0.014 |
| 2.469999999999885 | 0.003 | 0.021 | 0.014 |
| 2.474999999999885 | 0.003 | 0.02 | 0.014 |
| 2.479999999999885 | 0.003 | 0.02 | 0.014 |
| 2.484999999999885 | 0.003 | 0.019 | 0.015 |
| 2.489999999999885 | 0.003 | 0.019 | 0.015 |
| 2.494999999999885 | 0.003 | 0.018 | 0.015 |
| 2.499999999999884 | 0.003 | 0.018 | 0.015 |
| 2.504999999999884 | 0.003 | 0.017 | 0.015 |
| 2.509999999999884 | 0.003 | 0.017 | 0.016 |
| 2.514999999999884 | 0.003 | 0.016 | 0.016 |
| 2.519999999999884 | 0.003 | 0.016 | 0.016 |
| 2.524999999999884 | 0.003 | 0.016 | 0.017 |
| 2.529999999999884 | 0.003 | 0.015 | 0.017 |
| 2.534999999999884 | 0.003 | 0.015 | 0.017 |
| 2.539999999999884 | 0.003 | 0.015 | 0.017 |
| 2.544999999999884 | 0.003 | 0.014 | 0.018 |
| 2.549999999999883 | 0.003 | 0.014 | 0.018 |
| 2.554999999999883 | 0.003 | 0.014 | 0.018 |
| 2.559999999999883 | 0.003 | 0.013 | 0.019 |
| 2.564999999999883 | 0.003 | 0.013 | 0.019 |
| 2.569999999999883 | 0.003 | 0.013 | 0.019 |
| 2.574999999999883 | 0.003 | 0.012 | 0.02 |
| 2.579999999999883 | 0.002 | 0.012 | 0.02 |
| 2.584999999999883 | 0.002 | 0.012 | 0.021 |
| 2.589999999999883 | 0.002 | 0.012 | 0.021 |
| 2.594999999999882 | 0.002 | 0.011 | 0.021 |
| 2.599999999999882 | 0.002 | 0.011 | 0.022 |
| 2.604999999999882 | 0.002 | 0.011 | 0.022 |
| 2.609999999999882 | 0.002 | 0.011 | 0.023 |
| 2.614999999999882 | 0.002 | 0.011 | 0.023 |
| 2.619999999999882 | 0.002 | 0.01 | 0.024 |
| 2.624999999999882 | 0.002 | 0.01 | 0.024 |
| 2.629999999999882 | 0.002 | 0.01 | 0.025 |
| 2.634999999999882 | 0.002 | 0.01 | 0.025 |
| 2.639999999999881 | 0.002 | 0.009 | 0.026 |
| 2.644999999999881 | 0.002 | 0.009 | 0.027 |
| 2.649999999999881 | 0.002 | 0.009 | 0.027 |
| 2.654999999999881 | 0.002 | 0.009 | 0.028 |
| 2.659999999999881 | 0.002 | 0.009 | 0.029 |
| 2.664999999999881 | 0.002 | 0.009 | 0.029 |
| 2.669999999999881 | 0.002 | 0.008 | 0.03 |
| 2.674999999999881 | 0.002 | 0.008 | 0.031 |
| 2.679999999999881 | 0.002 | 0.008 | 0.032 |
| 2.68499999999988 | 0.002 | 0.008 | 0.032 |
| 2.68999999999988 | 0.002 | 0.008 | 0.033 |
| 2.69499999999988 | 0.002 | 0.008 | 0.034 |
| 2.69999999999988 | 0.002 | 0.008 | 0.035 |
| 2.70499999999988 | 0.002 | 0.007 | 0.036 |
| 2.70999999999988 | 0.002 | 0.007 | 0.037 |
| 2.71499999999988 | 0.002 | 0.007 | 0.038 |
| 2.71999999999988 | 0.002 | 0.007 | 0.04 |
| 2.72499999999988 | 0.002 | 0.007 | 0.041 |
| 2.72999999999988 | 0.002 | 0.007 | 0.042 |
| 2.734999999999879 | 0.002 | 0.007 | 0.044 |
| 2.739999999999879 | 0.002 | 0.006 | 0.045 |
| 2.744999999999879 | 0.002 | 0.006 | 0.047 |
| 2.749999999999879 | 0.002 | 0.006 | 0.048 |
| 2.754999999999879 | 0.002 | 0.006 | 0.05 |
| 2.759999999999879 | 0.002 | 0.006 | 0.052 |
| 2.764999999999879 | 0.002 | 0.006 | 0.054 |
| 2.769999999999879 | 0.002 | 0.006 | 0.056 |
| 2.774999999999879 | 0.002 | 0.006 | 0.058 |
| 2.779999999999878 | 0.002 | 0.006 | 0.06 |
| 2.784999999999878 | 0.002 | 0.006 | 0.063 |
| 2.789999999999878 | 0.002 | 0.005 | 0.066 |
| 2.794999999999878 | 0.002 | 0.005 | 0.068 |
| 2.799999999999878 | 0.002 | 0.005 | 0.072 |
| 2.804999999999878 | 0.002 | 0.005 | 0.075 |
| 2.809999999999878 | 0.002 | 0.005 | 0.078 |
| 2.814999999999878 | 0.002 | 0.005 | 0.082 |
| 2.819999999999878 | 0.001 | 0.005 | 0.087 |
| 2.824999999999878 | 0.001 | 0.005 | 0.091 |
| 2.829999999999877 | 0.001 | 0.005 | 0.096 |
| 2.834999999999877 | 0.001 | 0.005 | 0.101 |
| 2.839999999999877 | 0.001 | 0.005 | 0.107 |
| 2.844999999999877 | 0.001 | 0.005 | 0.114 |
| 2.849999999999877 | 0.001 | 0.004 | 0.121 |
| 2.854999999999877 | 0.001 | 0.004 | 0.128 |
| 2.859999999999877 | 0.001 | 0.004 | 0.137 |
| 2.864999999999877 | 0.001 | 0.004 | 0.147 |
| 2.869999999999877 | 0.001 | 0.004 | 0.157 |
| 2.874999999999876 | 0.001 | 0.004 | 0.169 |
| 2.879999999999876 | 0.001 | 0.004 | 0.183 |
| 2.884999999999876 | 0.001 | 0.004 | 0.198 |
| 2.889999999999876 | 0.001 | 0.004 | 0.215 |
| 2.894999999999876 | 0.001 | 0.004 | 0.235 |
| 2.899999999999876 | 0.001 | 0.004 | 0.257 |
| 2.904999999999876 | 0.001 | 0.004 | 0.284 |
| 2.909999999999876 | 0.001 | 0.004 | 0.314 |
| 2.914999999999876 | 0.001 | 0.004 | 0.35 |
| 2.919999999999876 | 0.001 | 0.004 | 0.393 |
| 2.924999999999875 | 0.001 | 0.004 | 0.445 |
| 2.929999999999875 | 0.001 | 0.004 | 0.508 |
| 2.934999999999875 | 0.001 | 0.003 | 0.587 |
| 2.939999999999875 | 0.001 | 0.003 | 0.685 |
| 2.944999999999875 | 0.001 | 0.003 | 0.81 |
| 2.949999999999875 | 0.001 | 0.003 | 0.975 |
| 2.954999999999875 | 0.001 | 0.003 | 1.198 |
| 2.959999999999875 | 0.001 | 0.003 | 1.508 |
| 2.964999999999875 | 0.001 | 0.003 | 1.959 |
| 2.969999999999874 | 0.001 | 0.003 | 2.653 |
| 2.974999999999874 | 0.001 | 0.003 | 3.8 |
| 2.979999999999874 | 0.001 | 0.003 | 5.907 |
| 2.984999999999874 | 0.001 | 0.003 | 10.447 |
| 2.989999999999874 | 0.001 | 0.003 | 23.384 |
| 2.994999999999874 | 0.001 | 0.003 | 93.061 |
| 2.999999999999874 | 0.001 | 0.003 | 145525510286523003568128 |
| 3.004999999999874 | 0.001 | 0.003 | 92.135 |
| 3.009999999999874 | 0.001 | 0.003 | 22.921 |
| 3.014999999999874 | 0.001 | 0.003 | 10.138 |
| 3.019999999999873 | 0.001 | 0.003 | 5.675 |
| 3.024999999999873 | 0.001 | 0.003 | 3.615 |
| 3.029999999999873 | 0.001 | 0.003 | 2.499 |
| 3.034999999999873 | 0.001 | 0.003 | 1.827 |
| 3.039999999999873 | 0.001 | 0.003 | 1.392 |
| 3.044999999999873 | 0.001 | 0.003 | 1.095 |
| 3.049999999999873 | 0.001 | 0.003 | 0.883 |
| 3.054999999999873 | 0.001 | 0.002 | 0.726 |
| 3.059999999999873 | 0.001 | 0.002 | 0.608 |
| 3.064999999999872 | 0.001 | 0.002 | 0.515 |
| 3.069999999999872 | 0.001 | 0.002 | 0.442 |
| 3.074999999999872 | 0.001 | 0.002 | 0.384 |
| 3.079999999999872 | 0.001 | 0.002 | 0.336 |
| 3.084999999999872 | 0.001 | 0.002 | 0.296 |
| 3.089999999999872 | 0.001 | 0.002 | 0.263 |
| 3.094999999999872 | 0.001 | 0.002 | 0.235 |
| 3.099999999999872 | 0.001 | 0.002 | 0.211 |
| 3.104999999999872 | 0.001 | 0.002 | 0.191 |
| 3.109999999999872 | 0.001 | 0.002 | 0.173 |
| 3.114999999999871 | 0.001 | 0.002 | 0.158 |
| 3.119999999999871 | 0.001 | 0.002 | 0.144 |
| 3.124999999999871 | 0.001 | 0.002 | 0.132 |
| 3.129999999999871 | 0.001 | 0.002 | 0.122 |
| 3.134999999999871 | 0.001 | 0.002 | 0.112 |
| 3.139999999999871 | 0.001 | 0.002 | 0.104 |
| 3.144999999999871 | 0.001 | 0.002 | 0.097 |
| 3.149999999999871 | 0.001 | 0.002 | 0.09 |
| 3.154999999999871 | 0.001 | 0.002 | 0.084 |
| 3.15999999999987 | 0.001 | 0.002 | 0.078 |
| 3.16499999999987 | 0.001 | 0.002 | 0.073 |
| 3.16999999999987 | 0.001 | 0.002 | 0.069 |
| 3.17499999999987 | 0.001 | 0.002 | 0.065 |
| 3.17999999999987 | 0.001 | 0.002 | 0.061 |
| 3.18499999999987 | 0.001 | 0.002 | 0.057 |
| 3.18999999999987 | 0.001 | 0.002 | 0.054 |
| 3.19499999999987 | 0.001 | 0.002 | 0.051 |
| 3.19999999999987 | 0.001 | 0.002 | 0.049 |
| 3.204999999999869 | 0.001 | 0.002 | 0.046 |
| 3.209999999999869 | 0.001 | 0.002 | 0.044 |
| 3.214999999999869 | 0.001 | 0.002 | 0.041 |
| 3.219999999999869 | 0.001 | 0.002 | 0.039 |
| 3.224999999999869 | 0.001 | 0.002 | 0.038 |
| 3.229999999999869 | 0.001 | 0.002 | 0.036 |
| 3.234999999999869 | 0.001 | 0.002 | 0.034 |
| 3.239999999999869 | 0.001 | 0.002 | 0.033 |
| 3.244999999999869 | 0.001 | 0.002 | 0.031 |
| 3.249999999999869 | 0.001 | 0.002 | 0.03 |
| 3.254999999999868 | 0.001 | 0.002 | 0.029 |
| 3.259999999999868 | 0.001 | 0.001 | 0.027 |
| 3.264999999999868 | 0.001 | 0.001 | 0.026 |
| 3.269999999999868 | 0.001 | 0.001 | 0.025 |
| 3.274999999999868 | 0.001 | 0.001 | 0.024 |
| 3.279999999999868 | 0.001 | 0.001 | 0.023 |
| 3.284999999999868 | 0.001 | 0.001 | 0.022 |
| 3.289999999999868 | 0.001 | 0.001 | 0.021 |
| 3.294999999999868 | 0.001 | 0.001 | 0.021 |
| 3.299999999999867 | 0.001 | 0.001 | 0.02 |
| 3.304999999999867 | 0.001 | 0.001 | 0.019 |
| 3.309999999999867 | 0.001 | 0.001 | 0.019 |
| 3.314999999999867 | 0.001 | 0.001 | 0.018 |
| 3.319999999999867 | 0.001 | 0.001 | 0.017 |
| 3.324999999999867 | 0.001 | 0.001 | 0.017 |
| 3.329999999999867 | 0.001 | 0.001 | 0.016 |
| 3.334999999999867 | 0.001 | 0.001 | 0.016 |
| 3.339999999999867 | 0.001 | 0.001 | 0.015 |
| 3.344999999999866 | 0.001 | 0.001 | 0.015 |
| 3.349999999999866 | 0.001 | 0.001 | 0.014 |
| 3.354999999999866 | 0.001 | 0.001 | 0.014 |
| 3.359999999999866 | 0.001 | 0.001 | 0.013 |
| 3.364999999999866 | 0.001 | 0.001 | 0.013 |
| 3.369999999999866 | 0.001 | 0.001 | 0.012 |
| 3.374999999999866 | 0.001 | 0.001 | 0.012 |
| 3.379999999999866 | 0.001 | 0.001 | 0.012 |
| 3.384999999999866 | 0.001 | 0.001 | 0.011 |
| 3.389999999999866 | 0.001 | 0.001 | 0.011 |
| 3.394999999999865 | 0.001 | 0.001 | 0.011 |
| 3.399999999999865 | 0.001 | 0.001 | 0.01 |
| 3.404999999999865 | 0.001 | 0.001 | 0.01 |
| 3.409999999999865 | 0.001 | 0.001 | 0.01 |
| 3.414999999999865 | 0.001 | 0.001 | 0.01 |
| 3.419999999999865 | 0.001 | 0.001 | 0.009 |
| 3.424999999999865 | 0.001 | 0.001 | 0.009 |
| 3.429999999999865 | 0.001 | 0.001 | 0.009 |
| 3.434999999999865 | 0.001 | 0.001 | 0.009 |
| 3.439999999999864 | 0.001 | 0.001 | 0.008 |
| 3.444999999999864 | 0 | 0.001 | 0.008 |
| 3.449999999999864 | 0 | 0.001 | 0.008 |
| 3.454999999999864 | 0 | 0.001 | 0.008 |
| 3.459999999999864 | 0 | 0.001 | 0.008 |
| 3.464999999999864 | 0 | 0.001 | 0.007 |
| 3.469999999999864 | 0 | 0.001 | 0.007 |
| 3.474999999999864 | 0 | 0.001 | 0.007 |
| 3.479999999999864 | 0 | 0.001 | 0.007 |
| 3.484999999999864 | 0 | 0.001 | 0.007 |
| 3.489999999999863 | 0 | 0.001 | 0.006 |
| 3.494999999999863 | 0 | 0.001 | 0.006 |
| 3.499999999999863 | 0 | 0.001 | 0.006 |
| 3.504999999999863 | 0 | 0.001 | 0.006 |
| 3.509999999999863 | 0 | 0.001 | 0.006 |
| 3.514999999999863 | 0 | 0.001 | 0.006 |
| 3.519999999999863 | 0 | 0.001 | 0.006 |
| 3.524999999999863 | 0 | 0.001 | 0.006 |
| 3.529999999999863 | 0 | 0.001 | 0.005 |
| 3.534999999999862 | 0 | 0.001 | 0.005 |
| 3.539999999999862 | 0 | 0.001 | 0.005 |
| 3.544999999999862 | 0 | 0.001 | 0.005 |
| 3.549999999999862 | 0 | 0.001 | 0.005 |
| 3.554999999999862 | 0 | 0.001 | 0.005 |
| 3.559999999999862 | 0 | 0.001 | 0.005 |
| 3.564999999999862 | 0 | 0.001 | 0.005 |
| 3.569999999999862 | 0 | 0.001 | 0.005 |
| 3.574999999999862 | 0 | 0.001 | 0.004 |
| 3.579999999999862 | 0 | 0.001 | 0.004 |
| 3.584999999999861 | 0 | 0.001 | 0.004 |
| 3.589999999999861 | 0 | 0.001 | 0.004 |
| 3.594999999999861 | 0 | 0.001 | 0.004 |
| 3.599999999999861 | 0 | 0.001 | 0.004 |
| 3.604999999999861 | 0 | 0.001 | 0.004 |
| 3.609999999999861 | 0 | 0.001 | 0.004 |
| 3.614999999999861 | 0 | 0.001 | 0.004 |
| 3.619999999999861 | 0 | 0.001 | 0.004 |
| 3.62499999999986 | 0 | 0.001 | 0.004 |
| 3.62999999999986 | 0 | 0.001 | 0.004 |
| 3.63499999999986 | 0 | 0.001 | 0.004 |
| 3.63999999999986 | 0 | 0.001 | 0.003 |
| 3.64499999999986 | 0 | 0.001 | 0.003 |
| 3.64999999999986 | 0 | 0.001 | 0.003 |
| 3.65499999999986 | 0 | 0.001 | 0.003 |
| 3.65999999999986 | 0 | 0.001 | 0.003 |
| 3.66499999999986 | 0 | 0.001 | 0.003 |
| 3.669999999999859 | 0 | 0.001 | 0.003 |
| 3.674999999999859 | 0 | 0.001 | 0.003 |
| 3.679999999999859 | 0 | 0.001 | 0.003 |
| 3.684999999999859 | 0 | 0.001 | 0.003 |
| 3.689999999999859 | 0 | 0.001 | 0.003 |
| 3.694999999999859 | 0 | 0.001 | 0.003 |
| 3.699999999999859 | 0 | 0.001 | 0.003 |
| 3.704999999999859 | 0 | 0.001 | 0.003 |
| 3.709999999999859 | 0 | 0.001 | 0.003 |
| 3.714999999999859 | 0 | 0.001 | 0.003 |
| 3.719999999999858 | 0 | 0.001 | 0.003 |
| 3.724999999999858 | 0 | 0.001 | 0.003 |
| 3.729999999999858 | 0 | 0.001 | 0.002 |
| 3.734999999999858 | 0 | 0.001 | 0.002 |
| 3.739999999999858 | 0 | 0.001 | 0.002 |
| 3.744999999999858 | 0 | 0.001 | 0.002 |
| 3.749999999999858 | 0 | 0.001 | 0.002 |
| 3.754999999999858 | 0 | 0.001 | 0.002 |
| 3.759999999999858 | 0 | 0.001 | 0.002 |
| 3.764999999999857 | 0 | 0.001 | 0.002 |
| 3.769999999999857 | 0 | 0.001 | 0.002 |
| 3.774999999999857 | 0 | 0.001 | 0.002 |
| 3.779999999999857 | 0 | 0.001 | 0.002 |
| 3.784999999999857 | 0 | 0.001 | 0.002 |
| 3.789999999999857 | 0 | 0.001 | 0.002 |
| 3.794999999999857 | 0 | 0.001 | 0.002 |
| 3.799999999999857 | 0 | 0.001 | 0.002 |
| 3.804999999999857 | 0 | 0 | 0.002 |
| 3.809999999999857 | 0 | 0 | 0.002 |
| 3.814999999999856 | 0 | 0 | 0.002 |
| 3.819999999999856 | 0 | 0 | 0.002 |
| 3.824999999999856 | 0 | 0 | 0.002 |
| 3.829999999999856 | 0 | 0 | 0.002 |
| 3.834999999999856 | 0 | 0 | 0.002 |
| 3.839999999999856 | 0 | 0 | 0.002 |
| 3.844999999999856 | 0 | 0 | 0.002 |
| 3.849999999999856 | 0 | 0 | 0.002 |
| 3.854999999999856 | 0 | 0 | 0.002 |
| 3.859999999999855 | 0 | 0 | 0.002 |
| 3.864999999999855 | 0 | 0 | 0.002 |
| 3.869999999999855 | 0 | 0 | 0.002 |
| 3.874999999999855 | 0 | 0 | 0.002 |
| 3.879999999999855 | 0 | 0 | 0.002 |
| 3.884999999999855 | 0 | 0 | 0.002 |
| 3.889999999999855 | 0 | 0 | 0.002 |
| 3.894999999999855 | 0 | 0 | 0.001 |
| 3.899999999999855 | 0 | 0 | 0.001 |
| 3.904999999999855 | 0 | 0 | 0.001 |
| 3.909999999999854 | 0 | 0 | 0.001 |
| 3.914999999999854 | 0 | 0 | 0.001 |
| 3.919999999999854 | 0 | 0 | 0.001 |
| 3.924999999999854 | 0 | 0 | 0.001 |
| 3.929999999999854 | 0 | 0 | 0.001 |
| 3.934999999999854 | 0 | 0 | 0.001 |
| 3.939999999999854 | 0 | 0 | 0.001 |
| 3.944999999999854 | 0 | 0 | 0.001 |
| 3.949999999999854 | 0 | 0 | 0.001 |
| 3.954999999999853 | 0 | 0 | 0.001 |
| 3.959999999999853 | 0 | 0 | 0.001 |
| 3.964999999999853 | 0 | 0 | 0.001 |
| 3.969999999999853 | 0 | 0 | 0.001 |
| 3.974999999999853 | 0 | 0 | 0.001 |
| 3.979999999999853 | 0 | 0 | 0.001 |
| 3.984999999999853 | 0 | 0 | 0.001 |
| 3.989999999999853 | 0 | 0 | 0.001 |
| 3.994999999999853 | 0 | 0 | 0.001 |
| 3.999999999999853 | 0 | 0 | 0.001 |
| 4.004999999999852 | 0 | 0 | 0.001 |
| 4.009999999999852 | 0 | 0 | 0.001 |
| 4.014999999999852 | 0 | 0 | 0.001 |
| 4.019999999999852 | 0 | 0 | 0.001 |
| 4.024999999999852 | 0 | 0 | 0.001 |
| 4.029999999999852 | 0 | 0 | 0.001 |
| 4.034999999999852 | 0 | 0 | 0.001 |
| 4.039999999999851 | 0 | 0 | 0.001 |
| 4.044999999999852 | 0 | 0 | 0.001 |
| 4.049999999999851 | 0 | 0 | 0.001 |
| 4.054999999999851 | 0 | 0 | 0.001 |
| 4.059999999999851 | 0 | 0 | 0.001 |
| 4.064999999999851 | 0 | 0 | 0.001 |
| 4.069999999999851 | 0 | 0 | 0.001 |
| 4.074999999999851 | 0 | 0 | 0.001 |
| 4.07999999999985 | 0 | 0 | 0.001 |
| 4.084999999999851 | 0 | 0 | 0.001 |
| 4.08999999999985 | 0 | 0 | 0.001 |
| 4.094999999999851 | 0 | 0 | 0.001 |
| 4.09999999999985 | 0 | 0 | 0.001 |
| 4.10499999999985 | 0 | 0 | 0.001 |
| 4.10999999999985 | 0 | 0 | 0.001 |
| 4.11499999999985 | 0 | 0 | 0.001 |
| 4.11999999999985 | 0 | 0 | 0.001 |
| 4.12499999999985 | 0 | 0 | 0.001 |
| 4.12999999999985 | 0 | 0 | 0.001 |
| 4.13499999999985 | 0 | 0 | 0.001 |
| 4.13999999999985 | 0 | 0 | 0.001 |
| 4.144999999999849 | 0 | 0 | 0.001 |
| 4.14999999999985 | 0 | 0 | 0.001 |
| 4.154999999999849 | 0 | 0 | 0.001 |
| 4.15999999999985 | 0 | 0 | 0.001 |
| 4.164999999999849 | 0 | 0 | 0.001 |
| 4.169999999999849 | 0 | 0 | 0.001 |
| 4.174999999999849 | 0 | 0 | 0.001 |
| 4.179999999999848 | 0 | 0 | 0.001 |
| 4.184999999999849 | 0 | 0 | 0.001 |
| 4.189999999999848 | 0 | 0 | 0.001 |
| 4.194999999999848 | 0 | 0 | 0.001 |
| 4.199999999999848 | 0 | 0 | 0.001 |
| 4.204999999999848 | 0 | 0 | 0.001 |
| 4.209999999999848 | 0 | 0 | 0.001 |
| 4.214999999999848 | 0 | 0 | 0.001 |
| 4.219999999999847 | 0 | 0 | 0.001 |
| 4.224999999999848 | 0 | 0 | 0.001 |
| 4.229999999999847 | 0 | 0 | 0.001 |
| 4.234999999999847 | 0 | 0 | 0.001 |
| 4.239999999999847 | 0 | 0 | 0.001 |
| 4.244999999999847 | 0 | 0 | 0.001 |
| 4.249999999999847 | 0 | 0 | 0.001 |
| 4.254999999999847 | 0 | 0 | 0.001 |
| 4.259999999999846 | 0 | 0 | 0.001 |
| 4.264999999999847 | 0 | 0 | 0.001 |
| 4.269999999999846 | 0 | 0 | 0.001 |
| 4.274999999999846 | 0 | 0 | 0.001 |
| 4.279999999999846 | 0 | 0 | 0.001 |
| 4.284999999999846 | 0 | 0 | 0.001 |
| 4.289999999999846 | 0 | 0 | 0.001 |
| 4.294999999999846 | 0 | 0 | 0.001 |
| 4.299999999999846 | 0 | 0 | 0.001 |
| 4.304999999999846 | 0 | 0 | 0.001 |
| 4.309999999999845 | 0 | 0 | 0.001 |
| 4.314999999999846 | 0 | 0 | 0.001 |
| 4.319999999999845 | 0 | 0 | 0.001 |
| 4.324999999999846 | 0 | 0 | 0.001 |
| 4.329999999999845 | 0 | 0 | 0.001 |
| 4.334999999999845 | 0 | 0 | 0.001 |
| 4.339999999999845 | 0 | 0 | 0.001 |
| 4.344999999999845 | 0 | 0 | 0.001 |
| 4.349999999999845 | 0 | 0 | 0.001 |
| 4.354999999999845 | 0 | 0 | 0.001 |
| 4.359999999999844 | 0 | 0 | 0 |
| 4.364999999999845 | 0 | 0 | 0 |
| 4.369999999999844 | 0 | 0 | 0 |
| 4.374999999999844 | 0 | 0 | 0 |
| 4.379999999999844 | 0 | 0 | 0 |
| 4.384999999999844 | 0 | 0 | 0 |
| 4.389999999999844 | 0 | 0 | 0 |
| 4.394999999999844 | 0 | 0 | 0 |
| 4.399999999999844 | 0 | 0 | 0 |
| 4.404999999999844 | 0 | 0 | 0 |
| 4.409999999999843 | 0 | 0 | 0 |
| 4.414999999999844 | 0 | 0 | 0 |
| 4.419999999999843 | 0 | 0 | 0 |
| 4.424999999999843 | 0 | 0 | 0 |
| 4.429999999999843 | 0 | 0 | 0 |
| 4.434999999999843 | 0 | 0 | 0 |
| 4.439999999999843 | 0 | 0 | 0 |
| 4.444999999999843 | 0 | 0 | 0 |
| 4.449999999999842 | 0 | 0 | 0 |
| 4.454999999999843 | 0 | 0 | 0 |
| 4.459999999999842 | 0 | 0 | 0 |
| 4.464999999999843 | 0 | 0 | 0 |
| 4.469999999999842 | 0 | 0 | 0 |
| 4.474999999999842 | 0 | 0 | 0 |
| 4.479999999999842 | 0 | 0 | 0 |
| 4.484999999999842 | 0 | 0 | 0 |
| 4.489999999999842 | 0 | 0 | 0 |
| 4.494999999999842 | 0 | 0 | 0 |
| 4.499999999999841 | 0 | 0 | 0 |
| 4.504999999999842 | 0 | 0 | 0 |
| 4.509999999999841 | 0 | 0 | 0 |
| 4.514999999999842 | 0 | 0 | 0 |
| 4.519999999999841 | 0 | 0 | 0 |
| 4.524999999999841 | 0 | 0 | 0 |
| 4.529999999999841 | 0 | 0 | 0 |
| 4.534999999999841 | 0 | 0 | 0 |
| 4.53999999999984 | 0 | 0 | 0 |
| 4.544999999999841 | 0 | 0 | 0 |
| 4.54999999999984 | 0 | 0 | 0 |
| 4.554999999999841 | 0 | 0 | 0 |
| 4.55999999999984 | 0 | 0 | 0 |
| 4.564999999999841 | 0 | 0 | 0 |
| 4.56999999999984 | 0 | 0 | 0 |
| 4.57499999999984 | 0 | 0 | 0 |
| 4.57999999999984 | 0 | 0 | 0 |
| 4.58499999999984 | 0 | 0 | 0 |
| 4.58999999999984 | 0 | 0 | 0 |
| 4.59499999999984 | 0 | 0 | 0 |
| 4.59999999999984 | 0 | 0 | 0 |
| 4.60499999999984 | 0 | 0 | 0 |
| 4.60999999999984 | 0 | 0 | 0 |
| 4.614999999999839 | 0 | 0 | 0 |
| 4.61999999999984 | 0 | 0 | 0 |
| 4.624999999999839 | 0 | 0 | 0 |
| 4.62999999999984 | 0 | 0 | 0 |
| 4.634999999999839 | 0 | 0 | 0 |
| 4.639999999999838 | 0 | 0 | 0 |
| 4.644999999999839 | 0 | 0 | 0 |
| 4.649999999999838 | 0 | 0 | 0 |
| 4.654999999999839 | 0 | 0 | 0 |
| 4.659999999999838 | 0 | 0 | 0 |
| 4.664999999999838 | 0 | 0 | 0 |
| 4.669999999999838 | 0 | 0 | 0 |
| 4.674999999999838 | 0 | 0 | 0 |
| 4.679999999999837 | 0 | 0 | 0 |
| 4.684999999999838 | 0 | 0 | 0 |
| 4.689999999999837 | 0 | 0 | 0 |
| 4.694999999999838 | 0 | 0 | 0 |
| 4.699999999999837 | 0 | 0 | 0 |
| 4.704999999999837 | 0 | 0 | 0 |
| 4.709999999999837 | 0 | 0 | 0 |
| 4.714999999999837 | 0 | 0 | 0 |
| 4.719999999999837 | 0 | 0 | 0 |
| 4.724999999999837 | 0 | 0 | 0 |
| 4.729999999999836 | 0 | 0 | 0 |
| 4.734999999999836 | 0 | 0 | 0 |
| 4.739999999999836 | 0 | 0 | 0 |
| 4.744999999999836 | 0 | 0 | 0 |
| 4.749999999999836 | 0 | 0 | 0 |
| 4.754999999999836 | 0 | 0 | 0 |
| 4.759999999999836 | 0 | 0 | 0 |
| 4.764999999999836 | 0 | 0 | 0 |
| 4.769999999999836 | 0 | 0 | 0 |
| 4.774999999999835 | 0 | 0 | 0 |
| 4.779999999999835 | 0 | 0 | 0 |
| 4.784999999999835 | 0 | 0 | 0 |
| 4.789999999999835 | 0 | 0 | 0 |
| 4.794999999999835 | 0 | 0 | 0 |
| 4.799999999999835 | 0 | 0 | 0 |
| 4.804999999999835 | 0 | 0 | 0 |
| 4.809999999999835 | 0 | 0 | 0 |
| 4.814999999999835 | 0 | 0 | 0 |
| 4.819999999999835 | 0 | 0 | 0 |
| 4.824999999999835 | 0 | 0 | 0 |
| 4.829999999999834 | 0 | 0 | 0 |
| 4.834999999999834 | 0 | 0 | 0 |
| 4.839999999999834 | 0 | 0 | 0 |
| 4.844999999999834 | 0 | 0 | 0 |
| 4.849999999999834 | 0 | 0 | 0 |
| 4.854999999999834 | 0 | 0 | 0 |
| 4.859999999999834 | 0 | 0 | 0 |
| 4.864999999999834 | 0 | 0 | 0 |
| 4.869999999999834 | 0 | 0 | 0 |
| 4.874999999999834 | 0 | 0 | 0 |
| 4.879999999999833 | 0 | 0 | 0 |
| 4.884999999999834 | 0 | 0 | 0 |
| 4.889999999999833 | 0 | 0 | 0 |
| 4.894999999999833 | 0 | 0 | 0 |
| 4.899999999999833 | 0 | 0 | 0 |
| 4.904999999999833 | 0 | 0 | 0 |
| 4.909999999999833 | 0 | 0 | 0 |
| 4.914999999999833 | 0 | 0 | 0 |
| 4.919999999999832 | 0 | 0 | 0 |
| 4.924999999999833 | 0 | 0 | 0 |
| 4.929999999999832 | 0 | 0 | 0 |
| 4.934999999999832 | 0 | 0 | 0 |
| 4.939999999999832 | 0 | 0 | 0 |
| 4.944999999999832 | 0 | 0 | 0 |
| 4.949999999999832 | 0 | 0 | 0 |
| 4.954999999999832 | 0 | 0 | 0 |
| 4.959999999999832 | 0 | 0 | 0 |
| 4.964999999999832 | 0 | 0 | 0 |
| 4.969999999999831 | 0 | 0 | 0 |
| 4.974999999999831 | 0 | 0 | 0 |
| 4.97999999999983 | 0 | 0 | 0 |
| 4.984999999999831 | 0 | 0 | 0 |
| 4.98999999999983 | 0 | 0 | 0 |
| 4.994999999999831 | 0 | 0 | 0 |
| 4.99999999999983 | 0 | 0 | 0 |